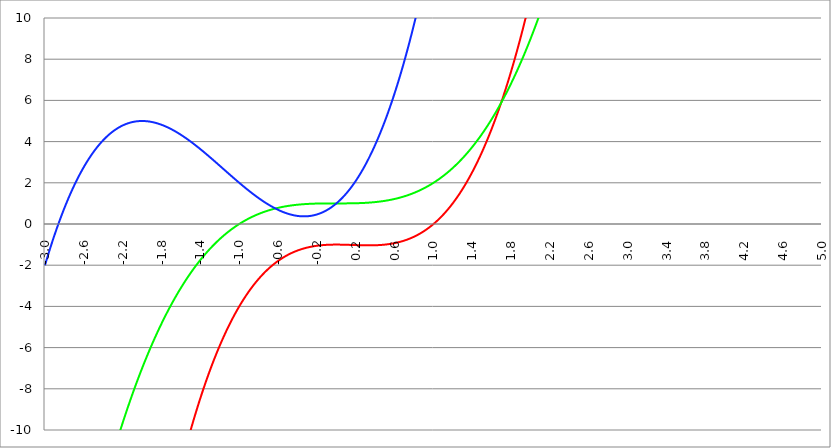
| Category | Series 1 | Series 0 | Series 2 |
|---|---|---|---|
| -3.0 | -64 | -26 | -2 |
| -2.996 | -63.76 | -25.892 | -1.936 |
| -2.992 | -63.521 | -25.785 | -1.873 |
| -2.988 | -63.283 | -25.677 | -1.81 |
| -2.984 | -63.045 | -25.57 | -1.747 |
| -2.98 | -62.808 | -25.464 | -1.684 |
| -2.976 | -62.571 | -25.357 | -1.622 |
| -2.972 | -62.335 | -25.251 | -1.561 |
| -2.968 | -62.099 | -25.145 | -1.499 |
| -2.964 | -61.865 | -25.04 | -1.438 |
| -2.96 | -61.63 | -24.934 | -1.377 |
| -2.956 | -61.397 | -24.829 | -1.317 |
| -2.952 | -61.164 | -24.725 | -1.257 |
| -2.948 | -60.931 | -24.62 | -1.197 |
| -2.944 | -60.699 | -24.516 | -1.138 |
| -2.94 | -60.468 | -24.412 | -1.079 |
| -2.936 | -60.237 | -24.309 | -1.021 |
| -2.932 | -60.007 | -24.205 | -0.962 |
| -2.928 | -59.778 | -24.102 | -0.904 |
| -2.924 | -59.549 | -24 | -0.847 |
| -2.92 | -59.321 | -23.897 | -0.789 |
| -2.916 | -59.093 | -23.795 | -0.732 |
| -2.912 | -58.866 | -23.693 | -0.676 |
| -2.908 | -58.639 | -23.591 | -0.62 |
| -2.904 | -58.413 | -23.49 | -0.564 |
| -2.9 | -58.188 | -23.389 | -0.508 |
| -2.896 | -57.963 | -23.288 | -0.453 |
| -2.892 | -57.739 | -23.188 | -0.398 |
| -2.888 | -57.516 | -23.087 | -0.343 |
| -2.884 | -57.293 | -22.988 | -0.289 |
| -2.88 | -57.07 | -22.888 | -0.235 |
| -2.876 | -56.848 | -22.788 | -0.181 |
| -2.872 | -56.627 | -22.689 | -0.128 |
| -2.868 | -56.406 | -22.591 | -0.075 |
| -2.864 | -56.186 | -22.492 | -0.022 |
| -2.86 | -55.967 | -22.394 | 0.03 |
| -2.856 | -55.748 | -22.296 | 0.082 |
| -2.852 | -55.53 | -22.198 | 0.134 |
| -2.848 | -55.312 | -22.1 | 0.185 |
| -2.844 | -55.095 | -22.003 | 0.236 |
| -2.84 | -54.878 | -21.906 | 0.287 |
| -2.836 | -54.662 | -21.81 | 0.337 |
| -2.832 | -54.447 | -21.713 | 0.387 |
| -2.828 | -54.232 | -21.617 | 0.437 |
| -2.824 | -54.018 | -21.521 | 0.486 |
| -2.82 | -53.804 | -21.426 | 0.535 |
| -2.816 | -53.591 | -21.33 | 0.584 |
| -2.812 | -53.378 | -21.235 | 0.633 |
| -2.808 | -53.166 | -21.141 | 0.681 |
| -2.804 | -52.955 | -21.046 | 0.728 |
| -2.8 | -52.744 | -20.952 | 0.776 |
| -2.796 | -52.534 | -20.858 | 0.823 |
| -2.792 | -52.324 | -20.764 | 0.87 |
| -2.788 | -52.115 | -20.671 | 0.917 |
| -2.784 | -51.906 | -20.578 | 0.963 |
| -2.78 | -51.698 | -20.485 | 1.009 |
| -2.776 | -51.491 | -20.392 | 1.055 |
| -2.772 | -51.284 | -20.3 | 1.1 |
| -2.768 | -51.078 | -20.208 | 1.145 |
| -2.764 | -50.872 | -20.116 | 1.19 |
| -2.76 | -50.667 | -20.025 | 1.234 |
| -2.756 | -50.462 | -19.933 | 1.278 |
| -2.752 | -50.258 | -19.842 | 1.322 |
| -2.748 | -50.055 | -19.752 | 1.365 |
| -2.744 | -49.852 | -19.661 | 1.409 |
| -2.74 | -49.649 | -19.571 | 1.452 |
| -2.736 | -49.447 | -19.481 | 1.494 |
| -2.732 | -49.246 | -19.391 | 1.536 |
| -2.728 | -49.045 | -19.302 | 1.578 |
| -2.724 | -48.845 | -19.213 | 1.62 |
| -2.72 | -48.646 | -19.124 | 1.662 |
| -2.716 | -48.447 | -19.035 | 1.703 |
| -2.712 | -48.248 | -18.947 | 1.743 |
| -2.708 | -48.05 | -18.858 | 1.784 |
| -2.704 | -47.853 | -18.771 | 1.824 |
| -2.7 | -47.656 | -18.683 | 1.864 |
| -2.696 | -47.46 | -18.596 | 1.904 |
| -2.692 | -47.264 | -18.509 | 1.943 |
| -2.688 | -47.069 | -18.422 | 1.982 |
| -2.684 | -46.874 | -18.335 | 2.021 |
| -2.68 | -46.68 | -18.249 | 2.059 |
| -2.676 | -46.487 | -18.163 | 2.097 |
| -2.672 | -46.294 | -18.077 | 2.135 |
| -2.668 | -46.101 | -17.991 | 2.173 |
| -2.664 | -45.909 | -17.906 | 2.21 |
| -2.66 | -45.718 | -17.821 | 2.247 |
| -2.656 | -45.527 | -17.736 | 2.284 |
| -2.652 | -45.337 | -17.652 | 2.32 |
| -2.648 | -45.147 | -17.568 | 2.356 |
| -2.644 | -44.958 | -17.484 | 2.392 |
| -2.64 | -44.769 | -17.4 | 2.428 |
| -2.636 | -44.581 | -17.316 | 2.463 |
| -2.632 | -44.393 | -17.233 | 2.498 |
| -2.628 | -44.206 | -17.15 | 2.533 |
| -2.624 | -44.02 | -17.067 | 2.567 |
| -2.62 | -43.834 | -16.985 | 2.601 |
| -2.616 | -43.648 | -16.902 | 2.635 |
| -2.612 | -43.464 | -16.82 | 2.669 |
| -2.608 | -43.279 | -16.739 | 2.702 |
| -2.604 | -43.095 | -16.657 | 2.735 |
| -2.6 | -42.912 | -16.576 | 2.768 |
| -2.596 | -42.729 | -16.495 | 2.801 |
| -2.592 | -42.547 | -16.414 | 2.833 |
| -2.588 | -42.365 | -16.334 | 2.865 |
| -2.584 | -42.184 | -16.254 | 2.896 |
| -2.58 | -42.003 | -16.174 | 2.928 |
| -2.576 | -41.823 | -16.094 | 2.959 |
| -2.572 | -41.644 | -16.014 | 2.99 |
| -2.568 | -41.465 | -15.935 | 3.02 |
| -2.564 | -41.286 | -15.856 | 3.051 |
| -2.56 | -41.108 | -15.777 | 3.081 |
| -2.556 | -40.931 | -15.699 | 3.111 |
| -2.552 | -40.754 | -15.62 | 3.14 |
| -2.548 | -40.577 | -15.542 | 3.169 |
| -2.544 | -40.401 | -15.465 | 3.198 |
| -2.54 | -40.226 | -15.387 | 3.227 |
| -2.536 | -40.051 | -15.31 | 3.256 |
| -2.532 | -39.876 | -15.233 | 3.284 |
| -2.528 | -39.703 | -15.156 | 3.312 |
| -2.524 | -39.529 | -15.079 | 3.339 |
| -2.52 | -39.356 | -15.003 | 3.367 |
| -2.516 | -39.184 | -14.927 | 3.394 |
| -2.512 | -39.012 | -14.851 | 3.421 |
| -2.508 | -38.841 | -14.775 | 3.447 |
| -2.504 | -38.67 | -14.7 | 3.474 |
| -2.5 | -38.5 | -14.625 | 3.5 |
| -2.496 | -38.33 | -14.55 | 3.526 |
| -2.492 | -38.161 | -14.475 | 3.551 |
| -2.488 | -37.992 | -14.401 | 3.577 |
| -2.484 | -37.824 | -14.327 | 3.602 |
| -2.48 | -37.656 | -14.253 | 3.627 |
| -2.476 | -37.489 | -14.179 | 3.651 |
| -2.472 | -37.323 | -14.106 | 3.676 |
| -2.467999999999999 | -37.156 | -14.033 | 3.7 |
| -2.463999999999999 | -36.991 | -13.96 | 3.724 |
| -2.459999999999999 | -36.825 | -13.887 | 3.747 |
| -2.455999999999999 | -36.661 | -13.814 | 3.771 |
| -2.451999999999999 | -36.497 | -13.742 | 3.794 |
| -2.447999999999999 | -36.333 | -13.67 | 3.817 |
| -2.443999999999999 | -36.17 | -13.598 | 3.839 |
| -2.439999999999999 | -36.007 | -13.527 | 3.862 |
| -2.435999999999999 | -35.845 | -13.455 | 3.884 |
| -2.431999999999999 | -35.683 | -13.384 | 3.906 |
| -2.427999999999999 | -35.522 | -13.314 | 3.927 |
| -2.423999999999999 | -35.362 | -13.243 | 3.949 |
| -2.419999999999999 | -35.201 | -13.172 | 3.97 |
| -2.415999999999999 | -35.042 | -13.102 | 3.991 |
| -2.411999999999999 | -34.883 | -13.032 | 4.011 |
| -2.407999999999999 | -34.724 | -12.963 | 4.032 |
| -2.403999999999999 | -34.566 | -12.893 | 4.052 |
| -2.399999999999999 | -34.408 | -12.824 | 4.072 |
| -2.395999999999999 | -34.251 | -12.755 | 4.092 |
| -2.391999999999999 | -34.094 | -12.686 | 4.111 |
| -2.387999999999999 | -33.938 | -12.618 | 4.13 |
| -2.383999999999999 | -33.782 | -12.549 | 4.149 |
| -2.379999999999999 | -33.627 | -12.481 | 4.168 |
| -2.375999999999999 | -33.472 | -12.413 | 4.187 |
| -2.371999999999999 | -33.318 | -12.346 | 4.205 |
| -2.367999999999999 | -33.164 | -12.278 | 4.223 |
| -2.363999999999999 | -33.011 | -12.211 | 4.241 |
| -2.359999999999999 | -32.858 | -12.144 | 4.259 |
| -2.355999999999999 | -32.706 | -12.078 | 4.276 |
| -2.351999999999999 | -32.554 | -12.011 | 4.293 |
| -2.347999999999999 | -32.403 | -11.945 | 4.31 |
| -2.343999999999999 | -32.252 | -11.879 | 4.327 |
| -2.339999999999999 | -32.101 | -11.813 | 4.343 |
| -2.335999999999999 | -31.952 | -11.747 | 4.36 |
| -2.331999999999999 | -31.802 | -11.682 | 4.376 |
| -2.327999999999999 | -31.653 | -11.617 | 4.392 |
| -2.323999999999999 | -31.505 | -11.552 | 4.407 |
| -2.319999999999999 | -31.357 | -11.487 | 4.422 |
| -2.315999999999999 | -31.209 | -11.423 | 4.438 |
| -2.311999999999999 | -31.062 | -11.358 | 4.453 |
| -2.307999999999999 | -30.916 | -11.294 | 4.467 |
| -2.303999999999999 | -30.77 | -11.231 | 4.482 |
| -2.299999999999999 | -30.624 | -11.167 | 4.496 |
| -2.295999999999999 | -30.479 | -11.104 | 4.51 |
| -2.291999999999999 | -30.334 | -11.04 | 4.524 |
| -2.288 | -30.19 | -10.978 | 4.538 |
| -2.284 | -30.046 | -10.915 | 4.551 |
| -2.279999999999999 | -29.903 | -10.852 | 4.564 |
| -2.275999999999999 | -29.76 | -10.79 | 4.577 |
| -2.271999999999999 | -29.618 | -10.728 | 4.59 |
| -2.268 | -29.476 | -10.666 | 4.602 |
| -2.264 | -29.335 | -10.605 | 4.615 |
| -2.259999999999999 | -29.194 | -10.543 | 4.627 |
| -2.255999999999999 | -29.054 | -10.482 | 4.639 |
| -2.251999999999999 | -28.914 | -10.421 | 4.65 |
| -2.248 | -28.774 | -10.36 | 4.662 |
| -2.244 | -28.635 | -10.3 | 4.673 |
| -2.239999999999999 | -28.496 | -10.239 | 4.684 |
| -2.235999999999999 | -28.358 | -10.179 | 4.695 |
| -2.231999999999999 | -28.221 | -10.119 | 4.706 |
| -2.228 | -28.083 | -10.06 | 4.716 |
| -2.224 | -27.947 | -10 | 4.727 |
| -2.219999999999999 | -27.81 | -9.941 | 4.737 |
| -2.215999999999999 | -27.675 | -9.882 | 4.747 |
| -2.211999999999999 | -27.539 | -9.823 | 4.756 |
| -2.208 | -27.404 | -9.765 | 4.766 |
| -2.204 | -27.27 | -9.706 | 4.775 |
| -2.199999999999999 | -27.136 | -9.648 | 4.784 |
| -2.195999999999999 | -27.002 | -9.59 | 4.793 |
| -2.191999999999999 | -26.869 | -9.532 | 4.802 |
| -2.188 | -26.737 | -9.475 | 4.81 |
| -2.184 | -26.605 | -9.417 | 4.818 |
| -2.179999999999999 | -26.473 | -9.36 | 4.826 |
| -2.175999999999999 | -26.342 | -9.303 | 4.834 |
| -2.171999999999999 | -26.211 | -9.247 | 4.842 |
| -2.168 | -26.08 | -9.19 | 4.849 |
| -2.164 | -25.95 | -9.134 | 4.857 |
| -2.159999999999999 | -25.821 | -9.078 | 4.864 |
| -2.155999999999999 | -25.692 | -9.022 | 4.871 |
| -2.151999999999999 | -25.563 | -8.966 | 4.877 |
| -2.148 | -25.435 | -8.911 | 4.884 |
| -2.144 | -25.308 | -8.855 | 4.89 |
| -2.139999999999999 | -25.18 | -8.8 | 4.897 |
| -2.135999999999999 | -25.053 | -8.745 | 4.902 |
| -2.131999999999999 | -24.927 | -8.691 | 4.908 |
| -2.128 | -24.801 | -8.636 | 4.914 |
| -2.124 | -24.676 | -8.582 | 4.919 |
| -2.119999999999999 | -24.551 | -8.528 | 4.925 |
| -2.115999999999999 | -24.426 | -8.474 | 4.93 |
| -2.111999999999999 | -24.302 | -8.421 | 4.934 |
| -2.108 | -24.178 | -8.367 | 4.939 |
| -2.104 | -24.055 | -8.314 | 4.944 |
| -2.099999999999999 | -23.932 | -8.261 | 4.948 |
| -2.095999999999999 | -23.81 | -8.208 | 4.952 |
| -2.091999999999999 | -23.688 | -8.156 | 4.956 |
| -2.088 | -23.566 | -8.103 | 4.96 |
| -2.084 | -23.445 | -8.051 | 4.964 |
| -2.079999999999999 | -23.324 | -7.999 | 4.967 |
| -2.075999999999999 | -23.204 | -7.947 | 4.97 |
| -2.071999999999999 | -23.084 | -7.895 | 4.973 |
| -2.068 | -22.965 | -7.844 | 4.976 |
| -2.064 | -22.846 | -7.793 | 4.979 |
| -2.059999999999999 | -22.727 | -7.742 | 4.982 |
| -2.055999999999999 | -22.609 | -7.691 | 4.984 |
| -2.051999999999999 | -22.491 | -7.64 | 4.986 |
| -2.048 | -22.374 | -7.59 | 4.988 |
| -2.044 | -22.257 | -7.54 | 4.99 |
| -2.039999999999999 | -22.141 | -7.49 | 4.992 |
| -2.035999999999999 | -22.025 | -7.44 | 4.993 |
| -2.031999999999999 | -21.909 | -7.39 | 4.995 |
| -2.028 | -21.794 | -7.341 | 4.996 |
| -2.024 | -21.68 | -7.291 | 4.997 |
| -2.019999999999999 | -21.565 | -7.242 | 4.998 |
| -2.015999999999999 | -21.451 | -7.194 | 4.999 |
| -2.011999999999999 | -21.338 | -7.145 | 4.999 |
| -2.008 | -21.225 | -7.096 | 5 |
| -2.004 | -21.112 | -7.048 | 5 |
| -1.999999999999999 | -21 | -7 | 5 |
| -1.995999999999999 | -20.888 | -6.952 | 5 |
| -1.991999999999999 | -20.777 | -6.904 | 5 |
| -1.987999999999999 | -20.666 | -6.857 | 4.999 |
| -1.983999999999999 | -20.555 | -6.81 | 4.999 |
| -1.979999999999999 | -20.445 | -6.762 | 4.998 |
| -1.975999999999999 | -20.335 | -6.715 | 4.997 |
| -1.971999999999999 | -20.226 | -6.669 | 4.996 |
| -1.967999999999999 | -20.117 | -6.622 | 4.995 |
| -1.963999999999999 | -20.009 | -6.576 | 4.994 |
| -1.959999999999999 | -19.901 | -6.53 | 4.992 |
| -1.955999999999999 | -19.793 | -6.484 | 4.99 |
| -1.951999999999999 | -19.686 | -6.438 | 4.989 |
| -1.947999999999999 | -19.579 | -6.392 | 4.987 |
| -1.943999999999999 | -19.472 | -6.347 | 4.985 |
| -1.939999999999999 | -19.366 | -6.301 | 4.982 |
| -1.935999999999999 | -19.261 | -6.256 | 4.98 |
| -1.931999999999999 | -19.155 | -6.211 | 4.978 |
| -1.927999999999999 | -19.051 | -6.167 | 4.975 |
| -1.923999999999999 | -18.946 | -6.122 | 4.972 |
| -1.919999999999999 | -18.842 | -6.078 | 4.969 |
| -1.915999999999999 | -18.739 | -6.034 | 4.966 |
| -1.911999999999999 | -18.635 | -5.99 | 4.963 |
| -1.907999999999999 | -18.532 | -5.946 | 4.959 |
| -1.903999999999999 | -18.43 | -5.902 | 4.956 |
| -1.899999999999999 | -18.328 | -5.859 | 4.952 |
| -1.895999999999999 | -18.226 | -5.816 | 4.948 |
| -1.891999999999999 | -18.125 | -5.773 | 4.944 |
| -1.887999999999999 | -18.024 | -5.73 | 4.94 |
| -1.883999999999999 | -17.924 | -5.687 | 4.936 |
| -1.879999999999999 | -17.824 | -5.645 | 4.931 |
| -1.875999999999999 | -17.724 | -5.602 | 4.927 |
| -1.871999999999999 | -17.625 | -5.56 | 4.922 |
| -1.867999999999999 | -17.526 | -5.518 | 4.917 |
| -1.863999999999999 | -17.427 | -5.476 | 4.913 |
| -1.859999999999999 | -17.329 | -5.435 | 4.907 |
| -1.855999999999999 | -17.232 | -5.393 | 4.902 |
| -1.851999999999999 | -17.134 | -5.352 | 4.897 |
| -1.847999999999999 | -17.037 | -5.311 | 4.892 |
| -1.843999999999999 | -16.941 | -5.27 | 4.886 |
| -1.839999999999999 | -16.845 | -5.23 | 4.88 |
| -1.835999999999999 | -16.749 | -5.189 | 4.874 |
| -1.831999999999999 | -16.653 | -5.149 | 4.868 |
| -1.827999999999999 | -16.558 | -5.108 | 4.862 |
| -1.823999999999999 | -16.464 | -5.068 | 4.856 |
| -1.819999999999999 | -16.37 | -5.029 | 4.85 |
| -1.815999999999999 | -16.276 | -4.989 | 4.843 |
| -1.811999999999999 | -16.182 | -4.949 | 4.837 |
| -1.807999999999999 | -16.089 | -4.91 | 4.83 |
| -1.803999999999999 | -15.996 | -4.871 | 4.823 |
| -1.799999999999999 | -15.904 | -4.832 | 4.816 |
| -1.795999999999999 | -15.812 | -4.793 | 4.809 |
| -1.791999999999999 | -15.72 | -4.755 | 4.802 |
| -1.787999999999999 | -15.629 | -4.716 | 4.794 |
| -1.783999999999999 | -15.538 | -4.678 | 4.787 |
| -1.779999999999999 | -15.448 | -4.64 | 4.779 |
| -1.775999999999999 | -15.358 | -4.602 | 4.772 |
| -1.771999999999999 | -15.268 | -4.564 | 4.764 |
| -1.767999999999999 | -15.179 | -4.526 | 4.756 |
| -1.763999999999999 | -15.09 | -4.489 | 4.748 |
| -1.759999999999999 | -15.001 | -4.452 | 4.74 |
| -1.755999999999999 | -14.913 | -4.415 | 4.731 |
| -1.751999999999999 | -14.825 | -4.378 | 4.723 |
| -1.747999999999999 | -14.738 | -4.341 | 4.714 |
| -1.743999999999999 | -14.65 | -4.304 | 4.706 |
| -1.739999999999999 | -14.564 | -4.268 | 4.697 |
| -1.735999999999999 | -14.477 | -4.232 | 4.688 |
| -1.731999999999999 | -14.391 | -4.196 | 4.679 |
| -1.727999999999999 | -14.306 | -4.16 | 4.67 |
| -1.723999999999999 | -14.22 | -4.124 | 4.661 |
| -1.719999999999999 | -14.135 | -4.088 | 4.652 |
| -1.715999999999999 | -14.051 | -4.053 | 4.643 |
| -1.711999999999999 | -13.966 | -4.018 | 4.633 |
| -1.707999999999999 | -13.883 | -3.983 | 4.623 |
| -1.703999999999999 | -13.799 | -3.948 | 4.614 |
| -1.699999999999999 | -13.716 | -3.913 | 4.604 |
| -1.695999999999999 | -13.633 | -3.878 | 4.594 |
| -1.691999999999999 | -13.551 | -3.844 | 4.584 |
| -1.687999999999999 | -13.469 | -3.81 | 4.574 |
| -1.683999999999999 | -13.387 | -3.776 | 4.564 |
| -1.679999999999999 | -13.306 | -3.742 | 4.554 |
| -1.675999999999999 | -13.225 | -3.708 | 4.543 |
| -1.671999999999999 | -13.144 | -3.674 | 4.533 |
| -1.667999999999999 | -13.064 | -3.641 | 4.522 |
| -1.663999999999999 | -12.984 | -3.607 | 4.511 |
| -1.659999999999999 | -12.904 | -3.574 | 4.501 |
| -1.655999999999999 | -12.825 | -3.541 | 4.49 |
| -1.651999999999999 | -12.746 | -3.508 | 4.479 |
| -1.647999999999999 | -12.668 | -3.476 | 4.468 |
| -1.643999999999999 | -12.589 | -3.443 | 4.457 |
| -1.639999999999999 | -12.511 | -3.411 | 4.445 |
| -1.635999999999999 | -12.434 | -3.379 | 4.434 |
| -1.631999999999999 | -12.357 | -3.347 | 4.423 |
| -1.627999999999999 | -12.28 | -3.315 | 4.411 |
| -1.623999999999999 | -12.204 | -3.283 | 4.399 |
| -1.619999999999999 | -12.127 | -3.252 | 4.388 |
| -1.615999999999999 | -12.052 | -3.22 | 4.376 |
| -1.611999999999999 | -11.976 | -3.189 | 4.364 |
| -1.607999999999999 | -11.901 | -3.158 | 4.352 |
| -1.603999999999999 | -11.826 | -3.127 | 4.34 |
| -1.599999999999999 | -11.752 | -3.096 | 4.328 |
| -1.595999999999999 | -11.678 | -3.065 | 4.316 |
| -1.591999999999999 | -11.604 | -3.035 | 4.304 |
| -1.587999999999999 | -11.531 | -3.005 | 4.291 |
| -1.583999999999999 | -11.458 | -2.974 | 4.279 |
| -1.579999999999999 | -11.385 | -2.944 | 4.266 |
| -1.575999999999999 | -11.313 | -2.914 | 4.254 |
| -1.571999999999999 | -11.241 | -2.885 | 4.241 |
| -1.567999999999999 | -11.169 | -2.855 | 4.228 |
| -1.563999999999999 | -11.097 | -2.826 | 4.215 |
| -1.559999999999999 | -11.026 | -2.796 | 4.202 |
| -1.555999999999999 | -10.956 | -2.767 | 4.189 |
| -1.551999999999999 | -10.885 | -2.738 | 4.176 |
| -1.547999999999999 | -10.815 | -2.709 | 4.163 |
| -1.543999999999999 | -10.746 | -2.681 | 4.15 |
| -1.539999999999999 | -10.676 | -2.652 | 4.137 |
| -1.535999999999999 | -10.607 | -2.624 | 4.123 |
| -1.531999999999999 | -10.538 | -2.596 | 4.11 |
| -1.527999999999999 | -10.47 | -2.568 | 4.096 |
| -1.523999999999999 | -10.402 | -2.54 | 4.083 |
| -1.519999999999999 | -10.334 | -2.512 | 4.069 |
| -1.515999999999999 | -10.267 | -2.484 | 4.055 |
| -1.511999999999999 | -10.199 | -2.457 | 4.042 |
| -1.507999999999999 | -10.133 | -2.429 | 4.028 |
| -1.503999999999999 | -10.066 | -2.402 | 4.014 |
| -1.499999999999999 | -10 | -2.375 | 4 |
| -1.495999999999999 | -9.934 | -2.348 | 3.986 |
| -1.491999999999999 | -9.869 | -2.321 | 3.972 |
| -1.487999999999999 | -9.803 | -2.295 | 3.958 |
| -1.483999999999999 | -9.739 | -2.268 | 3.943 |
| -1.479999999999999 | -9.674 | -2.242 | 3.929 |
| -1.475999999999999 | -9.61 | -2.216 | 3.915 |
| -1.471999999999999 | -9.546 | -2.19 | 3.9 |
| -1.467999999999999 | -9.482 | -2.164 | 3.886 |
| -1.463999999999999 | -9.419 | -2.138 | 3.872 |
| -1.459999999999999 | -9.356 | -2.112 | 3.857 |
| -1.455999999999999 | -9.293 | -2.087 | 3.842 |
| -1.451999999999999 | -9.231 | -2.061 | 3.828 |
| -1.447999999999999 | -9.169 | -2.036 | 3.813 |
| -1.443999999999999 | -9.107 | -2.011 | 3.798 |
| -1.439999999999999 | -9.046 | -1.986 | 3.783 |
| -1.435999999999999 | -8.984 | -1.961 | 3.768 |
| -1.431999999999999 | -8.924 | -1.936 | 3.753 |
| -1.427999999999999 | -8.863 | -1.912 | 3.738 |
| -1.423999999999999 | -8.803 | -1.888 | 3.723 |
| -1.419999999999999 | -8.743 | -1.863 | 3.708 |
| -1.415999999999999 | -8.683 | -1.839 | 3.693 |
| -1.411999999999999 | -8.624 | -1.815 | 3.678 |
| -1.407999999999999 | -8.565 | -1.791 | 3.663 |
| -1.403999999999999 | -8.506 | -1.768 | 3.647 |
| -1.399999999999999 | -8.448 | -1.744 | 3.632 |
| -1.395999999999999 | -8.39 | -1.721 | 3.617 |
| -1.391999999999999 | -8.332 | -1.697 | 3.601 |
| -1.387999999999999 | -8.275 | -1.674 | 3.586 |
| -1.383999999999999 | -8.217 | -1.651 | 3.57 |
| -1.379999999999999 | -8.161 | -1.628 | 3.555 |
| -1.375999999999999 | -8.104 | -1.605 | 3.539 |
| -1.371999999999999 | -8.048 | -1.583 | 3.523 |
| -1.367999999999998 | -7.992 | -1.56 | 3.508 |
| -1.363999999999998 | -7.936 | -1.538 | 3.492 |
| -1.359999999999998 | -7.881 | -1.515 | 3.476 |
| -1.355999999999998 | -7.825 | -1.493 | 3.46 |
| -1.351999999999998 | -7.771 | -1.471 | 3.445 |
| -1.347999999999998 | -7.716 | -1.449 | 3.429 |
| -1.343999999999998 | -7.662 | -1.428 | 3.413 |
| -1.339999999999998 | -7.608 | -1.406 | 3.397 |
| -1.335999999999998 | -7.554 | -1.385 | 3.381 |
| -1.331999999999998 | -7.501 | -1.363 | 3.365 |
| -1.327999999999998 | -7.448 | -1.342 | 3.349 |
| -1.323999999999998 | -7.395 | -1.321 | 3.333 |
| -1.319999999999998 | -7.342 | -1.3 | 3.317 |
| -1.315999999999998 | -7.29 | -1.279 | 3.301 |
| -1.311999999999998 | -7.238 | -1.258 | 3.285 |
| -1.307999999999998 | -7.186 | -1.238 | 3.268 |
| -1.303999999999998 | -7.135 | -1.217 | 3.252 |
| -1.299999999999998 | -7.084 | -1.197 | 3.236 |
| -1.295999999999998 | -7.033 | -1.177 | 3.22 |
| -1.291999999999998 | -6.983 | -1.157 | 3.203 |
| -1.287999999999998 | -6.932 | -1.137 | 3.187 |
| -1.283999999999998 | -6.882 | -1.117 | 3.171 |
| -1.279999999999998 | -6.833 | -1.097 | 3.154 |
| -1.275999999999998 | -6.783 | -1.078 | 3.138 |
| -1.271999999999998 | -6.734 | -1.058 | 3.122 |
| -1.267999999999998 | -6.685 | -1.039 | 3.105 |
| -1.263999999999998 | -6.637 | -1.019 | 3.089 |
| -1.259999999999998 | -6.588 | -1 | 3.072 |
| -1.255999999999998 | -6.54 | -0.981 | 3.056 |
| -1.251999999999998 | -6.493 | -0.963 | 3.039 |
| -1.247999999999998 | -6.445 | -0.944 | 3.023 |
| -1.243999999999998 | -6.398 | -0.925 | 3.006 |
| -1.239999999999998 | -6.351 | -0.907 | 2.99 |
| -1.235999999999998 | -6.304 | -0.888 | 2.973 |
| -1.231999999999998 | -6.258 | -0.87 | 2.957 |
| -1.227999999999998 | -6.212 | -0.852 | 2.94 |
| -1.223999999999998 | -6.166 | -0.834 | 2.924 |
| -1.219999999999998 | -6.12 | -0.816 | 2.907 |
| -1.215999999999998 | -6.075 | -0.798 | 2.891 |
| -1.211999999999998 | -6.03 | -0.78 | 2.874 |
| -1.207999999999998 | -5.985 | -0.763 | 2.857 |
| -1.203999999999998 | -5.94 | -0.745 | 2.841 |
| -1.199999999999998 | -5.896 | -0.728 | 2.824 |
| -1.195999999999998 | -5.852 | -0.711 | 2.807 |
| -1.191999999999998 | -5.808 | -0.694 | 2.791 |
| -1.187999999999998 | -5.765 | -0.677 | 2.774 |
| -1.183999999999998 | -5.721 | -0.66 | 2.757 |
| -1.179999999999998 | -5.678 | -0.643 | 2.741 |
| -1.175999999999998 | -5.636 | -0.626 | 2.724 |
| -1.171999999999998 | -5.593 | -0.61 | 2.707 |
| -1.167999999999998 | -5.551 | -0.593 | 2.691 |
| -1.163999999999998 | -5.509 | -0.577 | 2.674 |
| -1.159999999999998 | -5.467 | -0.561 | 2.657 |
| -1.155999999999998 | -5.426 | -0.545 | 2.641 |
| -1.151999999999998 | -5.385 | -0.529 | 2.624 |
| -1.147999999999998 | -5.344 | -0.513 | 2.607 |
| -1.143999999999998 | -5.303 | -0.497 | 2.591 |
| -1.139999999999998 | -5.263 | -0.482 | 2.574 |
| -1.135999999999998 | -5.223 | -0.466 | 2.557 |
| -1.131999999999998 | -5.183 | -0.451 | 2.541 |
| -1.127999999999998 | -5.143 | -0.435 | 2.524 |
| -1.123999999999998 | -5.103 | -0.42 | 2.508 |
| -1.119999999999998 | -5.064 | -0.405 | 2.491 |
| -1.115999999999998 | -5.025 | -0.39 | 2.474 |
| -1.111999999999998 | -4.987 | -0.375 | 2.458 |
| -1.107999999999998 | -4.948 | -0.36 | 2.441 |
| -1.103999999999998 | -4.91 | -0.346 | 2.425 |
| -1.099999999999998 | -4.872 | -0.331 | 2.408 |
| -1.095999999999998 | -4.834 | -0.317 | 2.391 |
| -1.091999999999998 | -4.797 | -0.302 | 2.375 |
| -1.087999999999998 | -4.76 | -0.288 | 2.358 |
| -1.083999999999998 | -4.723 | -0.274 | 2.342 |
| -1.079999999999998 | -4.686 | -0.26 | 2.325 |
| -1.075999999999998 | -4.649 | -0.246 | 2.309 |
| -1.071999999999998 | -4.613 | -0.232 | 2.292 |
| -1.067999999999998 | -4.577 | -0.218 | 2.276 |
| -1.063999999999998 | -4.541 | -0.205 | 2.26 |
| -1.059999999999998 | -4.506 | -0.191 | 2.243 |
| -1.055999999999998 | -4.47 | -0.178 | 2.227 |
| -1.051999999999998 | -4.435 | -0.164 | 2.21 |
| -1.047999999999998 | -4.4 | -0.151 | 2.194 |
| -1.043999999999998 | -4.366 | -0.138 | 2.178 |
| -1.039999999999998 | -4.331 | -0.125 | 2.161 |
| -1.035999999999998 | -4.297 | -0.112 | 2.145 |
| -1.031999999999998 | -4.263 | -0.099 | 2.129 |
| -1.027999999999998 | -4.23 | -0.086 | 2.113 |
| -1.023999999999998 | -4.196 | -0.074 | 2.097 |
| -1.019999999999998 | -4.163 | -0.061 | 2.08 |
| -1.015999999999998 | -4.13 | -0.049 | 2.064 |
| -1.011999999999998 | -4.097 | -0.036 | 2.048 |
| -1.007999999999998 | -4.064 | -0.024 | 2.032 |
| -1.003999999999998 | -4.032 | -0.012 | 2.016 |
| -0.999999999999998 | -4 | 0 | 2 |
| -0.995999999999998 | -3.968 | 0.012 | 1.984 |
| -0.991999999999998 | -3.936 | 0.024 | 1.968 |
| -0.987999999999998 | -3.905 | 0.036 | 1.952 |
| -0.983999999999998 | -3.874 | 0.047 | 1.936 |
| -0.979999999999998 | -3.843 | 0.059 | 1.92 |
| -0.975999999999998 | -3.812 | 0.07 | 1.905 |
| -0.971999999999998 | -3.781 | 0.082 | 1.889 |
| -0.967999999999998 | -3.751 | 0.093 | 1.873 |
| -0.963999999999998 | -3.721 | 0.104 | 1.857 |
| -0.959999999999998 | -3.691 | 0.115 | 1.842 |
| -0.955999999999998 | -3.661 | 0.126 | 1.826 |
| -0.951999999999998 | -3.632 | 0.137 | 1.811 |
| -0.947999999999998 | -3.603 | 0.148 | 1.795 |
| -0.943999999999998 | -3.574 | 0.159 | 1.779 |
| -0.939999999999998 | -3.545 | 0.169 | 1.764 |
| -0.935999999999998 | -3.516 | 0.18 | 1.749 |
| -0.931999999999998 | -3.488 | 0.19 | 1.733 |
| -0.927999999999998 | -3.46 | 0.201 | 1.718 |
| -0.923999999999998 | -3.432 | 0.211 | 1.703 |
| -0.919999999999998 | -3.404 | 0.221 | 1.687 |
| -0.915999999999998 | -3.376 | 0.231 | 1.672 |
| -0.911999999999998 | -3.349 | 0.241 | 1.657 |
| -0.907999999999998 | -3.322 | 0.251 | 1.642 |
| -0.903999999999998 | -3.295 | 0.261 | 1.627 |
| -0.899999999999998 | -3.268 | 0.271 | 1.612 |
| -0.895999999999998 | -3.241 | 0.281 | 1.597 |
| -0.891999999999998 | -3.215 | 0.29 | 1.582 |
| -0.887999999999998 | -3.189 | 0.3 | 1.567 |
| -0.883999999999998 | -3.163 | 0.309 | 1.553 |
| -0.879999999999998 | -3.137 | 0.319 | 1.538 |
| -0.875999999999998 | -3.112 | 0.328 | 1.523 |
| -0.871999999999998 | -3.086 | 0.337 | 1.509 |
| -0.867999999999998 | -3.061 | 0.346 | 1.494 |
| -0.863999999999998 | -3.036 | 0.355 | 1.48 |
| -0.859999999999998 | -3.012 | 0.364 | 1.465 |
| -0.855999999999998 | -2.987 | 0.373 | 1.451 |
| -0.851999999999998 | -2.963 | 0.382 | 1.436 |
| -0.847999999999998 | -2.939 | 0.39 | 1.422 |
| -0.843999999999998 | -2.915 | 0.399 | 1.408 |
| -0.839999999999998 | -2.891 | 0.407 | 1.394 |
| -0.835999999999998 | -2.867 | 0.416 | 1.38 |
| -0.831999999999998 | -2.844 | 0.424 | 1.366 |
| -0.827999999999998 | -2.821 | 0.432 | 1.352 |
| -0.823999999999998 | -2.798 | 0.441 | 1.338 |
| -0.819999999999998 | -2.775 | 0.449 | 1.324 |
| -0.815999999999998 | -2.753 | 0.457 | 1.31 |
| -0.811999999999998 | -2.73 | 0.465 | 1.297 |
| -0.807999999999998 | -2.708 | 0.472 | 1.283 |
| -0.803999999999998 | -2.686 | 0.48 | 1.269 |
| -0.799999999999998 | -2.664 | 0.488 | 1.256 |
| -0.795999999999998 | -2.642 | 0.496 | 1.243 |
| -0.791999999999998 | -2.621 | 0.503 | 1.229 |
| -0.787999999999998 | -2.6 | 0.511 | 1.216 |
| -0.783999999999998 | -2.578 | 0.518 | 1.203 |
| -0.779999999999998 | -2.558 | 0.525 | 1.19 |
| -0.775999999999998 | -2.537 | 0.533 | 1.177 |
| -0.771999999999998 | -2.516 | 0.54 | 1.164 |
| -0.767999999999998 | -2.496 | 0.547 | 1.151 |
| -0.763999999999998 | -2.476 | 0.554 | 1.138 |
| -0.759999999999998 | -2.456 | 0.561 | 1.125 |
| -0.755999999999998 | -2.436 | 0.568 | 1.113 |
| -0.751999999999998 | -2.416 | 0.575 | 1.1 |
| -0.747999999999998 | -2.397 | 0.581 | 1.088 |
| -0.743999999999998 | -2.377 | 0.588 | 1.075 |
| -0.739999999999998 | -2.358 | 0.595 | 1.063 |
| -0.735999999999998 | -2.339 | 0.601 | 1.05 |
| -0.731999999999998 | -2.32 | 0.608 | 1.038 |
| -0.727999999999998 | -2.302 | 0.614 | 1.026 |
| -0.723999999999998 | -2.283 | 0.62 | 1.014 |
| -0.719999999999998 | -2.265 | 0.627 | 1.002 |
| -0.715999999999998 | -2.247 | 0.633 | 0.99 |
| -0.711999999999998 | -2.229 | 0.639 | 0.979 |
| -0.707999999999998 | -2.211 | 0.645 | 0.967 |
| -0.703999999999998 | -2.193 | 0.651 | 0.955 |
| -0.699999999999998 | -2.176 | 0.657 | 0.944 |
| -0.695999999999998 | -2.159 | 0.663 | 0.933 |
| -0.691999999999998 | -2.142 | 0.669 | 0.921 |
| -0.687999999999998 | -2.125 | 0.674 | 0.91 |
| -0.683999999999998 | -2.108 | 0.68 | 0.899 |
| -0.679999999999998 | -2.091 | 0.686 | 0.888 |
| -0.675999999999998 | -2.075 | 0.691 | 0.877 |
| -0.671999999999998 | -2.059 | 0.697 | 0.866 |
| -0.667999999999998 | -2.042 | 0.702 | 0.855 |
| -0.663999999999998 | -2.026 | 0.707 | 0.845 |
| -0.659999999999998 | -2.011 | 0.713 | 0.834 |
| -0.655999999999998 | -1.995 | 0.718 | 0.824 |
| -0.651999999999998 | -1.979 | 0.723 | 0.813 |
| -0.647999999999998 | -1.964 | 0.728 | 0.803 |
| -0.643999999999998 | -1.949 | 0.733 | 0.793 |
| -0.639999999999998 | -1.934 | 0.738 | 0.783 |
| -0.635999999999998 | -1.919 | 0.743 | 0.773 |
| -0.631999999999998 | -1.904 | 0.748 | 0.763 |
| -0.627999999999998 | -1.89 | 0.752 | 0.753 |
| -0.623999999999998 | -1.875 | 0.757 | 0.744 |
| -0.619999999999998 | -1.861 | 0.762 | 0.734 |
| -0.615999999999998 | -1.847 | 0.766 | 0.725 |
| -0.611999999999998 | -1.833 | 0.771 | 0.715 |
| -0.607999999999998 | -1.819 | 0.775 | 0.706 |
| -0.603999999999998 | -1.806 | 0.78 | 0.697 |
| -0.599999999999998 | -1.792 | 0.784 | 0.688 |
| -0.595999999999998 | -1.779 | 0.788 | 0.679 |
| -0.591999999999998 | -1.765 | 0.793 | 0.67 |
| -0.587999999999998 | -1.752 | 0.797 | 0.662 |
| -0.583999999999998 | -1.739 | 0.801 | 0.653 |
| -0.579999999999998 | -1.727 | 0.805 | 0.645 |
| -0.575999999999998 | -1.714 | 0.809 | 0.636 |
| -0.571999999999998 | -1.701 | 0.813 | 0.628 |
| -0.567999999999998 | -1.689 | 0.817 | 0.62 |
| -0.563999999999998 | -1.677 | 0.821 | 0.612 |
| -0.559999999999998 | -1.665 | 0.824 | 0.604 |
| -0.555999999999998 | -1.653 | 0.828 | 0.596 |
| -0.551999999999998 | -1.641 | 0.832 | 0.589 |
| -0.547999999999998 | -1.629 | 0.835 | 0.581 |
| -0.543999999999998 | -1.618 | 0.839 | 0.574 |
| -0.539999999999998 | -1.607 | 0.843 | 0.566 |
| -0.535999999999998 | -1.595 | 0.846 | 0.559 |
| -0.531999999999998 | -1.584 | 0.849 | 0.552 |
| -0.527999999999998 | -1.573 | 0.853 | 0.545 |
| -0.523999999999998 | -1.562 | 0.856 | 0.538 |
| -0.519999999999998 | -1.552 | 0.859 | 0.532 |
| -0.515999999999998 | -1.541 | 0.863 | 0.525 |
| -0.511999999999998 | -1.531 | 0.866 | 0.519 |
| -0.507999999999998 | -1.52 | 0.869 | 0.512 |
| -0.503999999999998 | -1.51 | 0.872 | 0.506 |
| -0.499999999999998 | -1.5 | 0.875 | 0.5 |
| -0.495999999999998 | -1.49 | 0.878 | 0.494 |
| -0.491999999999998 | -1.48 | 0.881 | 0.488 |
| -0.487999999999998 | -1.471 | 0.884 | 0.483 |
| -0.483999999999998 | -1.461 | 0.887 | 0.477 |
| -0.479999999999998 | -1.452 | 0.889 | 0.472 |
| -0.475999999999998 | -1.442 | 0.892 | 0.466 |
| -0.471999999999998 | -1.433 | 0.895 | 0.461 |
| -0.467999999999998 | -1.424 | 0.897 | 0.456 |
| -0.463999999999998 | -1.415 | 0.9 | 0.451 |
| -0.459999999999998 | -1.406 | 0.903 | 0.447 |
| -0.455999999999998 | -1.398 | 0.905 | 0.442 |
| -0.451999999999998 | -1.389 | 0.908 | 0.437 |
| -0.447999999999998 | -1.381 | 0.91 | 0.433 |
| -0.443999999999998 | -1.372 | 0.912 | 0.429 |
| -0.439999999999998 | -1.364 | 0.915 | 0.425 |
| -0.435999999999998 | -1.356 | 0.917 | 0.421 |
| -0.431999999999998 | -1.348 | 0.919 | 0.417 |
| -0.427999999999998 | -1.34 | 0.922 | 0.413 |
| -0.423999999999998 | -1.332 | 0.924 | 0.41 |
| -0.419999999999998 | -1.325 | 0.926 | 0.407 |
| -0.415999999999998 | -1.317 | 0.928 | 0.403 |
| -0.411999999999998 | -1.31 | 0.93 | 0.4 |
| -0.407999999999998 | -1.302 | 0.932 | 0.397 |
| -0.403999999999998 | -1.295 | 0.934 | 0.395 |
| -0.399999999999998 | -1.288 | 0.936 | 0.392 |
| -0.395999999999998 | -1.281 | 0.938 | 0.39 |
| -0.391999999999998 | -1.274 | 0.94 | 0.387 |
| -0.387999999999998 | -1.267 | 0.942 | 0.385 |
| -0.383999999999998 | -1.261 | 0.943 | 0.383 |
| -0.379999999999998 | -1.254 | 0.945 | 0.381 |
| -0.375999999999998 | -1.248 | 0.947 | 0.379 |
| -0.371999999999998 | -1.241 | 0.949 | 0.378 |
| -0.367999999999998 | -1.235 | 0.95 | 0.376 |
| -0.363999999999998 | -1.229 | 0.952 | 0.375 |
| -0.359999999999998 | -1.223 | 0.953 | 0.374 |
| -0.355999999999998 | -1.217 | 0.955 | 0.373 |
| -0.351999999999998 | -1.211 | 0.956 | 0.372 |
| -0.347999999999998 | -1.205 | 0.958 | 0.371 |
| -0.343999999999998 | -1.2 | 0.959 | 0.371 |
| -0.339999999999998 | -1.194 | 0.961 | 0.371 |
| -0.335999999999998 | -1.189 | 0.962 | 0.37 |
| -0.331999999999998 | -1.183 | 0.963 | 0.37 |
| -0.327999999999998 | -1.178 | 0.965 | 0.371 |
| -0.323999999999998 | -1.173 | 0.966 | 0.371 |
| -0.319999999999998 | -1.168 | 0.967 | 0.371 |
| -0.315999999999998 | -1.163 | 0.968 | 0.372 |
| -0.311999999999998 | -1.158 | 0.97 | 0.373 |
| -0.307999999999998 | -1.153 | 0.971 | 0.374 |
| -0.303999999999998 | -1.149 | 0.972 | 0.375 |
| -0.299999999999998 | -1.144 | 0.973 | 0.376 |
| -0.295999999999998 | -1.139 | 0.974 | 0.377 |
| -0.291999999999998 | -1.135 | 0.975 | 0.379 |
| -0.287999999999998 | -1.131 | 0.976 | 0.381 |
| -0.283999999999998 | -1.126 | 0.977 | 0.383 |
| -0.279999999999998 | -1.122 | 0.978 | 0.385 |
| -0.275999999999998 | -1.118 | 0.979 | 0.387 |
| -0.271999999999998 | -1.114 | 0.98 | 0.39 |
| -0.267999999999998 | -1.11 | 0.981 | 0.392 |
| -0.263999999999998 | -1.106 | 0.982 | 0.395 |
| -0.259999999999998 | -1.103 | 0.982 | 0.398 |
| -0.255999999999998 | -1.099 | 0.983 | 0.401 |
| -0.251999999999998 | -1.096 | 0.984 | 0.405 |
| -0.247999999999998 | -1.092 | 0.985 | 0.408 |
| -0.243999999999998 | -1.089 | 0.985 | 0.412 |
| -0.239999999999998 | -1.085 | 0.986 | 0.416 |
| -0.235999999999998 | -1.082 | 0.987 | 0.42 |
| -0.231999999999998 | -1.079 | 0.988 | 0.424 |
| -0.227999999999998 | -1.076 | 0.988 | 0.428 |
| -0.223999999999998 | -1.073 | 0.989 | 0.433 |
| -0.219999999999998 | -1.07 | 0.989 | 0.438 |
| -0.215999999999998 | -1.067 | 0.99 | 0.442 |
| -0.211999999999998 | -1.064 | 0.99 | 0.448 |
| -0.207999999999998 | -1.061 | 0.991 | 0.453 |
| -0.203999999999998 | -1.059 | 0.992 | 0.458 |
| -0.199999999999997 | -1.056 | 0.992 | 0.464 |
| -0.195999999999997 | -1.053 | 0.992 | 0.47 |
| -0.191999999999997 | -1.051 | 0.993 | 0.476 |
| -0.187999999999997 | -1.049 | 0.993 | 0.482 |
| -0.183999999999997 | -1.046 | 0.994 | 0.489 |
| -0.179999999999997 | -1.044 | 0.994 | 0.495 |
| -0.175999999999997 | -1.042 | 0.995 | 0.502 |
| -0.171999999999997 | -1.04 | 0.995 | 0.509 |
| -0.167999999999997 | -1.038 | 0.995 | 0.516 |
| -0.163999999999997 | -1.036 | 0.996 | 0.523 |
| -0.159999999999997 | -1.034 | 0.996 | 0.531 |
| -0.155999999999997 | -1.032 | 0.996 | 0.539 |
| -0.151999999999997 | -1.03 | 0.996 | 0.547 |
| -0.147999999999997 | -1.028 | 0.997 | 0.555 |
| -0.143999999999997 | -1.027 | 0.997 | 0.563 |
| -0.139999999999997 | -1.025 | 0.997 | 0.572 |
| -0.135999999999997 | -1.024 | 0.997 | 0.58 |
| -0.131999999999997 | -1.022 | 0.998 | 0.589 |
| -0.127999999999997 | -1.021 | 0.998 | 0.598 |
| -0.123999999999997 | -1.019 | 0.998 | 0.608 |
| -0.119999999999997 | -1.018 | 0.998 | 0.617 |
| -0.115999999999997 | -1.017 | 0.998 | 0.627 |
| -0.111999999999997 | -1.015 | 0.999 | 0.637 |
| -0.107999999999997 | -1.014 | 0.999 | 0.647 |
| -0.103999999999997 | -1.013 | 0.999 | 0.657 |
| -0.0999999999999974 | -1.012 | 0.999 | 0.668 |
| -0.0959999999999974 | -1.011 | 0.999 | 0.679 |
| -0.0919999999999974 | -1.01 | 0.999 | 0.69 |
| -0.0879999999999974 | -1.009 | 0.999 | 0.701 |
| -0.0839999999999974 | -1.008 | 0.999 | 0.712 |
| -0.0799999999999974 | -1.007 | 0.999 | 0.724 |
| -0.0759999999999974 | -1.007 | 1 | 0.736 |
| -0.0719999999999974 | -1.006 | 1 | 0.748 |
| -0.0679999999999974 | -1.005 | 1 | 0.76 |
| -0.0639999999999974 | -1.005 | 1 | 0.772 |
| -0.0599999999999974 | -1.004 | 1 | 0.785 |
| -0.0559999999999974 | -1.003 | 1 | 0.798 |
| -0.0519999999999974 | -1.003 | 1 | 0.811 |
| -0.0479999999999974 | -1.003 | 1 | 0.824 |
| -0.0439999999999974 | -1.002 | 1 | 0.837 |
| -0.0399999999999974 | -1.002 | 1 | 0.851 |
| -0.0359999999999974 | -1.001 | 1 | 0.865 |
| -0.0319999999999974 | -1.001 | 1 | 0.879 |
| -0.0279999999999974 | -1.001 | 1 | 0.893 |
| -0.0239999999999974 | -1.001 | 1 | 0.908 |
| -0.0199999999999974 | -1 | 1 | 0.923 |
| -0.0159999999999974 | -1 | 1 | 0.938 |
| -0.0119999999999974 | -1 | 1 | 0.953 |
| -0.00799999999999736 | -1 | 1 | 0.968 |
| -0.00399999999999736 | -1 | 1 | 0.984 |
| 2.63677968348475e-15 | -1 | 1 | 1 |
| 0.00400000000000264 | -1 | 1 | 1.016 |
| 0.00800000000000264 | -1 | 1 | 1.032 |
| 0.0120000000000026 | -1 | 1 | 1.049 |
| 0.0160000000000026 | -1 | 1 | 1.066 |
| 0.0200000000000026 | -1 | 1 | 1.083 |
| 0.0240000000000026 | -1.001 | 1 | 1.1 |
| 0.0280000000000026 | -1.001 | 1 | 1.118 |
| 0.0320000000000026 | -1.001 | 1 | 1.135 |
| 0.0360000000000026 | -1.001 | 1 | 1.153 |
| 0.0400000000000026 | -1.001 | 1 | 1.171 |
| 0.0440000000000026 | -1.002 | 1 | 1.19 |
| 0.0480000000000026 | -1.002 | 1 | 1.208 |
| 0.0520000000000026 | -1.002 | 1 | 1.227 |
| 0.0560000000000026 | -1.003 | 1 | 1.246 |
| 0.0600000000000027 | -1.003 | 1 | 1.266 |
| 0.0640000000000027 | -1.004 | 1 | 1.285 |
| 0.0680000000000027 | -1.004 | 1 | 1.305 |
| 0.0720000000000027 | -1.004 | 1 | 1.325 |
| 0.0760000000000027 | -1.005 | 1 | 1.345 |
| 0.0800000000000027 | -1.005 | 1.001 | 1.366 |
| 0.0840000000000027 | -1.006 | 1.001 | 1.387 |
| 0.0880000000000027 | -1.006 | 1.001 | 1.408 |
| 0.0920000000000027 | -1.007 | 1.001 | 1.429 |
| 0.0960000000000027 | -1.007 | 1.001 | 1.45 |
| 0.100000000000003 | -1.008 | 1.001 | 1.472 |
| 0.104000000000003 | -1.009 | 1.001 | 1.494 |
| 0.108000000000003 | -1.009 | 1.001 | 1.516 |
| 0.112000000000003 | -1.01 | 1.001 | 1.539 |
| 0.116000000000003 | -1.01 | 1.002 | 1.561 |
| 0.120000000000003 | -1.011 | 1.002 | 1.584 |
| 0.124000000000003 | -1.012 | 1.002 | 1.607 |
| 0.128000000000003 | -1.012 | 1.002 | 1.631 |
| 0.132000000000003 | -1.013 | 1.002 | 1.655 |
| 0.136000000000003 | -1.013 | 1.003 | 1.679 |
| 0.140000000000003 | -1.014 | 1.003 | 1.703 |
| 0.144000000000003 | -1.015 | 1.003 | 1.727 |
| 0.148000000000003 | -1.015 | 1.003 | 1.752 |
| 0.152000000000003 | -1.016 | 1.004 | 1.777 |
| 0.156000000000003 | -1.017 | 1.004 | 1.802 |
| 0.160000000000003 | -1.017 | 1.004 | 1.827 |
| 0.164000000000003 | -1.018 | 1.004 | 1.853 |
| 0.168000000000003 | -1.019 | 1.005 | 1.879 |
| 0.172000000000003 | -1.019 | 1.005 | 1.905 |
| 0.176000000000003 | -1.02 | 1.005 | 1.932 |
| 0.180000000000003 | -1.021 | 1.006 | 1.958 |
| 0.184000000000003 | -1.021 | 1.006 | 1.985 |
| 0.188000000000003 | -1.022 | 1.007 | 2.013 |
| 0.192000000000003 | -1.023 | 1.007 | 2.04 |
| 0.196000000000003 | -1.023 | 1.008 | 2.068 |
| 0.200000000000003 | -1.024 | 1.008 | 2.096 |
| 0.204000000000003 | -1.025 | 1.008 | 2.124 |
| 0.208000000000003 | -1.025 | 1.009 | 2.153 |
| 0.212000000000003 | -1.026 | 1.01 | 2.182 |
| 0.216000000000003 | -1.027 | 1.01 | 2.211 |
| 0.220000000000003 | -1.027 | 1.011 | 2.24 |
| 0.224000000000003 | -1.028 | 1.011 | 2.27 |
| 0.228000000000003 | -1.028 | 1.012 | 2.3 |
| 0.232000000000003 | -1.029 | 1.012 | 2.33 |
| 0.236000000000003 | -1.029 | 1.013 | 2.36 |
| 0.240000000000003 | -1.03 | 1.014 | 2.391 |
| 0.244000000000003 | -1.03 | 1.015 | 2.422 |
| 0.248000000000003 | -1.031 | 1.015 | 2.453 |
| 0.252000000000003 | -1.031 | 1.016 | 2.485 |
| 0.256000000000003 | -1.032 | 1.017 | 2.516 |
| 0.260000000000003 | -1.032 | 1.018 | 2.548 |
| 0.264000000000003 | -1.033 | 1.018 | 2.581 |
| 0.268000000000003 | -1.033 | 1.019 | 2.613 |
| 0.272000000000003 | -1.034 | 1.02 | 2.646 |
| 0.276000000000003 | -1.034 | 1.021 | 2.679 |
| 0.280000000000003 | -1.034 | 1.022 | 2.713 |
| 0.284000000000003 | -1.035 | 1.023 | 2.746 |
| 0.288000000000003 | -1.035 | 1.024 | 2.78 |
| 0.292000000000003 | -1.035 | 1.025 | 2.815 |
| 0.296000000000003 | -1.036 | 1.026 | 2.849 |
| 0.300000000000003 | -1.036 | 1.027 | 2.884 |
| 0.304000000000003 | -1.036 | 1.028 | 2.919 |
| 0.308000000000003 | -1.036 | 1.029 | 2.954 |
| 0.312000000000003 | -1.037 | 1.03 | 2.99 |
| 0.316000000000003 | -1.037 | 1.032 | 3.026 |
| 0.320000000000003 | -1.037 | 1.033 | 3.062 |
| 0.324000000000003 | -1.037 | 1.034 | 3.099 |
| 0.328000000000003 | -1.037 | 1.035 | 3.136 |
| 0.332000000000003 | -1.037 | 1.037 | 3.173 |
| 0.336000000000003 | -1.037 | 1.038 | 3.21 |
| 0.340000000000003 | -1.037 | 1.039 | 3.248 |
| 0.344000000000003 | -1.037 | 1.041 | 3.286 |
| 0.348000000000003 | -1.037 | 1.042 | 3.324 |
| 0.352000000000003 | -1.037 | 1.044 | 3.363 |
| 0.356000000000003 | -1.036 | 1.045 | 3.401 |
| 0.360000000000003 | -1.036 | 1.047 | 3.441 |
| 0.364000000000003 | -1.036 | 1.048 | 3.48 |
| 0.368000000000003 | -1.036 | 1.05 | 3.52 |
| 0.372000000000003 | -1.035 | 1.051 | 3.56 |
| 0.376000000000003 | -1.035 | 1.053 | 3.6 |
| 0.380000000000003 | -1.035 | 1.055 | 3.641 |
| 0.384000000000003 | -1.034 | 1.057 | 3.681 |
| 0.388000000000003 | -1.034 | 1.058 | 3.723 |
| 0.392000000000003 | -1.033 | 1.06 | 3.764 |
| 0.396000000000003 | -1.033 | 1.062 | 3.806 |
| 0.400000000000003 | -1.032 | 1.064 | 3.848 |
| 0.404000000000003 | -1.031 | 1.066 | 3.89 |
| 0.408000000000003 | -1.031 | 1.068 | 3.933 |
| 0.412000000000003 | -1.03 | 1.07 | 3.976 |
| 0.416000000000003 | -1.029 | 1.072 | 4.019 |
| 0.420000000000003 | -1.028 | 1.074 | 4.063 |
| 0.424000000000003 | -1.027 | 1.076 | 4.107 |
| 0.428000000000003 | -1.026 | 1.078 | 4.151 |
| 0.432000000000003 | -1.025 | 1.081 | 4.196 |
| 0.436000000000003 | -1.024 | 1.083 | 4.24 |
| 0.440000000000003 | -1.023 | 1.085 | 4.286 |
| 0.444000000000003 | -1.022 | 1.088 | 4.331 |
| 0.448000000000003 | -1.021 | 1.09 | 4.377 |
| 0.452000000000003 | -1.02 | 1.092 | 4.423 |
| 0.456000000000003 | -1.018 | 1.095 | 4.469 |
| 0.460000000000003 | -1.017 | 1.097 | 4.516 |
| 0.464000000000003 | -1.016 | 1.1 | 4.563 |
| 0.468000000000003 | -1.014 | 1.103 | 4.61 |
| 0.472000000000003 | -1.012 | 1.105 | 4.658 |
| 0.476000000000003 | -1.011 | 1.108 | 4.706 |
| 0.480000000000003 | -1.009 | 1.111 | 4.754 |
| 0.484000000000003 | -1.007 | 1.113 | 4.803 |
| 0.488000000000003 | -1.006 | 1.116 | 4.851 |
| 0.492000000000003 | -1.004 | 1.119 | 4.901 |
| 0.496000000000003 | -1.002 | 1.122 | 4.95 |
| 0.500000000000003 | -1 | 1.125 | 5 |
| 0.504000000000003 | -0.998 | 1.128 | 5.05 |
| 0.508000000000003 | -0.996 | 1.131 | 5.101 |
| 0.512000000000003 | -0.994 | 1.134 | 5.151 |
| 0.516000000000003 | -0.991 | 1.137 | 5.203 |
| 0.520000000000003 | -0.989 | 1.141 | 5.254 |
| 0.524000000000003 | -0.987 | 1.144 | 5.306 |
| 0.528000000000003 | -0.984 | 1.147 | 5.358 |
| 0.532000000000003 | -0.982 | 1.151 | 5.41 |
| 0.536000000000003 | -0.979 | 1.154 | 5.463 |
| 0.540000000000003 | -0.977 | 1.157 | 5.516 |
| 0.544000000000003 | -0.974 | 1.161 | 5.57 |
| 0.548000000000003 | -0.971 | 1.165 | 5.623 |
| 0.552000000000003 | -0.968 | 1.168 | 5.677 |
| 0.556000000000003 | -0.965 | 1.172 | 5.732 |
| 0.560000000000003 | -0.962 | 1.176 | 5.786 |
| 0.564000000000003 | -0.959 | 1.179 | 5.841 |
| 0.568000000000003 | -0.956 | 1.183 | 5.897 |
| 0.572000000000003 | -0.953 | 1.187 | 5.953 |
| 0.576000000000003 | -0.95 | 1.191 | 6.009 |
| 0.580000000000003 | -0.946 | 1.195 | 6.065 |
| 0.584000000000003 | -0.943 | 1.199 | 6.122 |
| 0.588000000000003 | -0.939 | 1.203 | 6.179 |
| 0.592000000000003 | -0.936 | 1.207 | 6.236 |
| 0.596000000000003 | -0.932 | 1.212 | 6.294 |
| 0.600000000000003 | -0.928 | 1.216 | 6.352 |
| 0.604000000000003 | -0.924 | 1.22 | 6.41 |
| 0.608000000000003 | -0.92 | 1.225 | 6.469 |
| 0.612000000000003 | -0.916 | 1.229 | 6.528 |
| 0.616000000000003 | -0.912 | 1.234 | 6.588 |
| 0.620000000000003 | -0.908 | 1.238 | 6.647 |
| 0.624000000000003 | -0.903 | 1.243 | 6.708 |
| 0.628000000000003 | -0.899 | 1.248 | 6.768 |
| 0.632000000000003 | -0.895 | 1.252 | 6.829 |
| 0.636000000000003 | -0.89 | 1.257 | 6.89 |
| 0.640000000000003 | -0.885 | 1.262 | 6.951 |
| 0.644000000000003 | -0.881 | 1.267 | 7.013 |
| 0.648000000000003 | -0.876 | 1.272 | 7.076 |
| 0.652000000000003 | -0.871 | 1.277 | 7.138 |
| 0.656000000000003 | -0.866 | 1.282 | 7.201 |
| 0.660000000000003 | -0.861 | 1.287 | 7.264 |
| 0.664000000000003 | -0.855 | 1.293 | 7.328 |
| 0.668000000000003 | -0.85 | 1.298 | 7.392 |
| 0.672000000000003 | -0.845 | 1.303 | 7.456 |
| 0.676000000000003 | -0.839 | 1.309 | 7.521 |
| 0.680000000000003 | -0.834 | 1.314 | 7.586 |
| 0.684000000000003 | -0.828 | 1.32 | 7.651 |
| 0.688000000000003 | -0.822 | 1.326 | 7.717 |
| 0.692000000000003 | -0.816 | 1.331 | 7.783 |
| 0.696000000000003 | -0.81 | 1.337 | 7.849 |
| 0.700000000000003 | -0.804 | 1.343 | 7.916 |
| 0.704000000000003 | -0.798 | 1.349 | 7.983 |
| 0.708000000000003 | -0.791 | 1.355 | 8.051 |
| 0.712000000000003 | -0.785 | 1.361 | 8.118 |
| 0.716000000000003 | -0.779 | 1.367 | 8.187 |
| 0.720000000000003 | -0.772 | 1.373 | 8.255 |
| 0.724000000000003 | -0.765 | 1.38 | 8.324 |
| 0.728000000000003 | -0.758 | 1.386 | 8.394 |
| 0.732000000000003 | -0.751 | 1.392 | 8.463 |
| 0.736000000000003 | -0.744 | 1.399 | 8.533 |
| 0.740000000000003 | -0.737 | 1.405 | 8.604 |
| 0.744000000000003 | -0.73 | 1.412 | 8.674 |
| 0.748000000000003 | -0.722 | 1.419 | 8.746 |
| 0.752000000000003 | -0.715 | 1.425 | 8.817 |
| 0.756000000000003 | -0.707 | 1.432 | 8.889 |
| 0.760000000000003 | -0.7 | 1.439 | 8.961 |
| 0.764000000000003 | -0.692 | 1.446 | 9.034 |
| 0.768000000000003 | -0.684 | 1.453 | 9.107 |
| 0.772000000000003 | -0.676 | 1.46 | 9.18 |
| 0.776000000000003 | -0.668 | 1.467 | 9.254 |
| 0.780000000000003 | -0.659 | 1.475 | 9.328 |
| 0.784000000000003 | -0.651 | 1.482 | 9.402 |
| 0.788000000000003 | -0.642 | 1.489 | 9.477 |
| 0.792000000000003 | -0.634 | 1.497 | 9.552 |
| 0.796000000000003 | -0.625 | 1.504 | 9.628 |
| 0.800000000000003 | -0.616 | 1.512 | 9.704 |
| 0.804000000000003 | -0.607 | 1.52 | 9.78 |
| 0.808000000000003 | -0.598 | 1.528 | 9.857 |
| 0.812000000000003 | -0.589 | 1.535 | 9.934 |
| 0.816000000000003 | -0.579 | 1.543 | 10.012 |
| 0.820000000000003 | -0.57 | 1.551 | 10.09 |
| 0.824000000000003 | -0.56 | 1.559 | 10.168 |
| 0.828000000000003 | -0.55 | 1.568 | 10.246 |
| 0.832000000000003 | -0.54 | 1.576 | 10.325 |
| 0.836000000000003 | -0.53 | 1.584 | 10.405 |
| 0.840000000000003 | -0.52 | 1.593 | 10.485 |
| 0.844000000000003 | -0.51 | 1.601 | 10.565 |
| 0.848000000000003 | -0.5 | 1.61 | 10.645 |
| 0.852000000000003 | -0.489 | 1.618 | 10.726 |
| 0.856000000000003 | -0.478 | 1.627 | 10.808 |
| 0.860000000000003 | -0.467 | 1.636 | 10.889 |
| 0.864000000000003 | -0.457 | 1.645 | 10.971 |
| 0.868000000000003 | -0.445 | 1.654 | 11.054 |
| 0.872000000000003 | -0.434 | 1.663 | 11.137 |
| 0.876000000000003 | -0.423 | 1.672 | 11.22 |
| 0.880000000000003 | -0.411 | 1.681 | 11.304 |
| 0.884000000000003 | -0.4 | 1.691 | 11.388 |
| 0.888000000000003 | -0.388 | 1.7 | 11.472 |
| 0.892000000000003 | -0.376 | 1.71 | 11.557 |
| 0.896000000000003 | -0.364 | 1.719 | 11.642 |
| 0.900000000000003 | -0.352 | 1.729 | 11.728 |
| 0.904000000000003 | -0.34 | 1.739 | 11.814 |
| 0.908000000000003 | -0.327 | 1.749 | 11.9 |
| 0.912000000000003 | -0.315 | 1.759 | 11.987 |
| 0.916000000000003 | -0.302 | 1.769 | 12.075 |
| 0.920000000000003 | -0.289 | 1.779 | 12.162 |
| 0.924000000000003 | -0.276 | 1.789 | 12.25 |
| 0.928000000000003 | -0.263 | 1.799 | 12.339 |
| 0.932000000000003 | -0.25 | 1.81 | 12.427 |
| 0.936000000000003 | -0.236 | 1.82 | 12.517 |
| 0.940000000000003 | -0.222 | 1.831 | 12.606 |
| 0.944000000000003 | -0.209 | 1.841 | 12.696 |
| 0.948000000000003 | -0.195 | 1.852 | 12.787 |
| 0.952000000000003 | -0.181 | 1.863 | 12.878 |
| 0.956000000000003 | -0.166 | 1.874 | 12.969 |
| 0.960000000000003 | -0.152 | 1.885 | 13.061 |
| 0.964000000000003 | -0.138 | 1.896 | 13.153 |
| 0.968000000000003 | -0.123 | 1.907 | 13.245 |
| 0.972000000000003 | -0.108 | 1.918 | 13.338 |
| 0.976000000000003 | -0.093 | 1.93 | 13.431 |
| 0.980000000000003 | -0.078 | 1.941 | 13.525 |
| 0.984000000000003 | -0.063 | 1.953 | 13.619 |
| 0.988000000000003 | -0.047 | 1.964 | 13.714 |
| 0.992000000000003 | -0.032 | 1.976 | 13.809 |
| 0.996000000000003 | -0.016 | 1.988 | 13.904 |
| 1.000000000000003 | 0 | 2 | 14 |
| 1.004000000000003 | 0.016 | 2.012 | 14.096 |
| 1.008000000000003 | 0.032 | 2.024 | 14.193 |
| 1.012000000000003 | 0.049 | 2.036 | 14.29 |
| 1.016000000000003 | 0.065 | 2.049 | 14.387 |
| 1.020000000000003 | 0.082 | 2.061 | 14.485 |
| 1.024000000000003 | 0.099 | 2.074 | 14.584 |
| 1.028000000000003 | 0.116 | 2.086 | 14.682 |
| 1.032000000000003 | 0.133 | 2.099 | 14.781 |
| 1.036000000000003 | 0.151 | 2.112 | 14.881 |
| 1.040000000000003 | 0.168 | 2.125 | 14.981 |
| 1.044000000000003 | 0.186 | 2.138 | 15.081 |
| 1.048000000000003 | 0.204 | 2.151 | 15.182 |
| 1.052000000000003 | 0.222 | 2.164 | 15.283 |
| 1.056000000000003 | 0.24 | 2.178 | 15.385 |
| 1.060000000000003 | 0.258 | 2.191 | 15.487 |
| 1.064000000000003 | 0.277 | 2.205 | 15.59 |
| 1.068000000000003 | 0.296 | 2.218 | 15.693 |
| 1.072000000000003 | 0.315 | 2.232 | 15.796 |
| 1.076000000000003 | 0.334 | 2.246 | 15.9 |
| 1.080000000000003 | 0.353 | 2.26 | 16.004 |
| 1.084000000000003 | 0.372 | 2.274 | 16.109 |
| 1.088000000000003 | 0.392 | 2.288 | 16.214 |
| 1.092000000000003 | 0.412 | 2.302 | 16.32 |
| 1.096000000000003 | 0.432 | 2.317 | 16.426 |
| 1.100000000000003 | 0.452 | 2.331 | 16.532 |
| 1.104000000000003 | 0.472 | 2.346 | 16.639 |
| 1.108000000000003 | 0.493 | 2.36 | 16.746 |
| 1.112000000000003 | 0.514 | 2.375 | 16.854 |
| 1.116000000000003 | 0.534 | 2.39 | 16.962 |
| 1.120000000000003 | 0.555 | 2.405 | 17.071 |
| 1.124000000000003 | 0.577 | 2.42 | 17.18 |
| 1.128000000000003 | 0.598 | 2.435 | 17.289 |
| 1.132000000000003 | 0.62 | 2.451 | 17.399 |
| 1.136000000000003 | 0.642 | 2.466 | 17.509 |
| 1.140000000000003 | 0.663 | 2.482 | 17.62 |
| 1.144000000000003 | 0.686 | 2.497 | 17.732 |
| 1.148000000000003 | 0.708 | 2.513 | 17.843 |
| 1.152000000000003 | 0.731 | 2.529 | 17.955 |
| 1.156000000000003 | 0.753 | 2.545 | 18.068 |
| 1.160000000000003 | 0.776 | 2.561 | 18.181 |
| 1.164000000000003 | 0.799 | 2.577 | 18.294 |
| 1.168000000000003 | 0.823 | 2.593 | 18.408 |
| 1.172000000000003 | 0.846 | 2.61 | 18.523 |
| 1.176000000000003 | 0.87 | 2.626 | 18.638 |
| 1.180000000000003 | 0.894 | 2.643 | 18.753 |
| 1.184000000000003 | 0.918 | 2.66 | 18.869 |
| 1.188000000000003 | 0.942 | 2.677 | 18.985 |
| 1.192000000000003 | 0.966 | 2.694 | 19.101 |
| 1.196000000000003 | 0.991 | 2.711 | 19.218 |
| 1.200000000000003 | 1.016 | 2.728 | 19.336 |
| 1.204000000000003 | 1.041 | 2.745 | 19.454 |
| 1.208000000000004 | 1.066 | 2.763 | 19.572 |
| 1.212000000000004 | 1.092 | 2.78 | 19.691 |
| 1.216000000000004 | 1.117 | 2.798 | 19.811 |
| 1.220000000000004 | 1.143 | 2.816 | 19.93 |
| 1.224000000000004 | 1.169 | 2.834 | 20.051 |
| 1.228000000000004 | 1.196 | 2.852 | 20.171 |
| 1.232000000000004 | 1.222 | 2.87 | 20.293 |
| 1.236000000000004 | 1.249 | 2.888 | 20.414 |
| 1.240000000000004 | 1.276 | 2.907 | 20.536 |
| 1.244000000000004 | 1.303 | 2.925 | 20.659 |
| 1.248000000000004 | 1.33 | 2.944 | 20.782 |
| 1.252000000000004 | 1.358 | 2.963 | 20.906 |
| 1.256000000000004 | 1.385 | 2.981 | 21.03 |
| 1.260000000000004 | 1.413 | 3 | 21.154 |
| 1.264000000000004 | 1.441 | 3.019 | 21.279 |
| 1.268000000000004 | 1.47 | 3.039 | 21.404 |
| 1.272000000000004 | 1.498 | 3.058 | 21.53 |
| 1.276000000000004 | 1.527 | 3.078 | 21.656 |
| 1.280000000000004 | 1.556 | 3.097 | 21.783 |
| 1.284000000000004 | 1.585 | 3.117 | 21.91 |
| 1.288000000000004 | 1.614 | 3.137 | 22.038 |
| 1.292000000000004 | 1.644 | 3.157 | 22.166 |
| 1.296000000000004 | 1.674 | 3.177 | 22.295 |
| 1.300000000000004 | 1.704 | 3.197 | 22.424 |
| 1.304000000000004 | 1.734 | 3.217 | 22.554 |
| 1.308000000000004 | 1.765 | 3.238 | 22.684 |
| 1.312000000000004 | 1.795 | 3.258 | 22.814 |
| 1.316000000000004 | 1.826 | 3.279 | 22.945 |
| 1.320000000000004 | 1.858 | 3.3 | 23.077 |
| 1.324000000000004 | 1.889 | 3.321 | 23.209 |
| 1.328000000000004 | 1.92 | 3.342 | 23.341 |
| 1.332000000000004 | 1.952 | 3.363 | 23.474 |
| 1.336000000000004 | 1.984 | 3.385 | 23.608 |
| 1.340000000000004 | 2.017 | 3.406 | 23.741 |
| 1.344000000000004 | 2.049 | 3.428 | 23.876 |
| 1.348000000000004 | 2.082 | 3.449 | 24.011 |
| 1.352000000000004 | 2.115 | 3.471 | 24.146 |
| 1.356000000000004 | 2.148 | 3.493 | 24.282 |
| 1.360000000000004 | 2.181 | 3.515 | 24.418 |
| 1.364000000000004 | 2.215 | 3.538 | 24.555 |
| 1.368000000000004 | 2.249 | 3.56 | 24.692 |
| 1.372000000000004 | 2.283 | 3.583 | 24.83 |
| 1.376000000000004 | 2.317 | 3.605 | 24.968 |
| 1.380000000000004 | 2.352 | 3.628 | 25.107 |
| 1.384000000000004 | 2.387 | 3.651 | 25.246 |
| 1.388000000000004 | 2.422 | 3.674 | 25.386 |
| 1.392000000000004 | 2.457 | 3.697 | 25.526 |
| 1.396000000000004 | 2.492 | 3.721 | 25.667 |
| 1.400000000000004 | 2.528 | 3.744 | 25.808 |
| 1.404000000000004 | 2.564 | 3.768 | 25.95 |
| 1.408000000000004 | 2.6 | 3.791 | 26.092 |
| 1.412000000000004 | 2.637 | 3.815 | 26.235 |
| 1.416000000000004 | 2.673 | 3.839 | 26.378 |
| 1.420000000000004 | 2.71 | 3.863 | 26.521 |
| 1.424000000000004 | 2.747 | 3.888 | 26.666 |
| 1.428000000000004 | 2.785 | 3.912 | 26.81 |
| 1.432000000000004 | 2.822 | 3.936 | 26.955 |
| 1.436000000000004 | 2.86 | 3.961 | 27.101 |
| 1.440000000000004 | 2.898 | 3.986 | 27.247 |
| 1.444000000000004 | 2.937 | 4.011 | 27.394 |
| 1.448000000000004 | 2.975 | 4.036 | 27.541 |
| 1.452000000000004 | 3.014 | 4.061 | 27.689 |
| 1.456000000000004 | 3.053 | 4.087 | 27.837 |
| 1.460000000000004 | 3.093 | 4.112 | 27.985 |
| 1.464000000000004 | 3.132 | 4.138 | 28.135 |
| 1.468000000000004 | 3.172 | 4.164 | 28.284 |
| 1.472000000000004 | 3.212 | 4.19 | 28.435 |
| 1.476000000000004 | 3.253 | 4.216 | 28.585 |
| 1.480000000000004 | 3.293 | 4.242 | 28.736 |
| 1.484000000000004 | 3.334 | 4.268 | 28.888 |
| 1.488000000000004 | 3.375 | 4.295 | 29.04 |
| 1.492000000000004 | 3.417 | 4.321 | 29.193 |
| 1.496000000000004 | 3.458 | 4.348 | 29.346 |
| 1.500000000000004 | 3.5 | 4.375 | 29.5 |
| 1.504000000000004 | 3.542 | 4.402 | 29.654 |
| 1.508000000000004 | 3.585 | 4.429 | 29.809 |
| 1.512000000000004 | 3.627 | 4.457 | 29.964 |
| 1.516000000000004 | 3.67 | 4.484 | 30.12 |
| 1.520000000000004 | 3.713 | 4.512 | 30.276 |
| 1.524000000000004 | 3.757 | 4.54 | 30.433 |
| 1.528000000000004 | 3.8 | 4.568 | 30.591 |
| 1.532000000000004 | 3.844 | 4.596 | 30.748 |
| 1.536000000000004 | 3.888 | 4.624 | 30.907 |
| 1.540000000000004 | 3.933 | 4.652 | 31.066 |
| 1.544000000000004 | 3.978 | 4.681 | 31.225 |
| 1.548000000000004 | 4.023 | 4.709 | 31.385 |
| 1.552000000000004 | 4.068 | 4.738 | 31.546 |
| 1.556000000000004 | 4.113 | 4.767 | 31.707 |
| 1.560000000000004 | 4.159 | 4.796 | 31.868 |
| 1.564000000000004 | 4.205 | 4.826 | 32.03 |
| 1.568000000000004 | 4.252 | 4.855 | 32.193 |
| 1.572000000000004 | 4.298 | 4.885 | 32.356 |
| 1.576000000000004 | 4.345 | 4.914 | 32.519 |
| 1.580000000000004 | 4.392 | 4.944 | 32.683 |
| 1.584000000000004 | 4.44 | 4.974 | 32.848 |
| 1.588000000000004 | 4.487 | 5.005 | 33.013 |
| 1.592000000000004 | 4.535 | 5.035 | 33.179 |
| 1.596000000000004 | 4.583 | 5.065 | 33.345 |
| 1.600000000000004 | 4.632 | 5.096 | 33.512 |
| 1.604000000000004 | 4.681 | 5.127 | 33.679 |
| 1.608000000000004 | 4.73 | 5.158 | 33.847 |
| 1.612000000000004 | 4.779 | 5.189 | 34.016 |
| 1.616000000000004 | 4.829 | 5.22 | 34.184 |
| 1.620000000000004 | 4.879 | 5.252 | 34.354 |
| 1.624000000000004 | 4.929 | 5.283 | 34.524 |
| 1.628000000000004 | 4.979 | 5.315 | 34.694 |
| 1.632000000000004 | 5.03 | 5.347 | 34.865 |
| 1.636000000000004 | 5.081 | 5.379 | 35.037 |
| 1.640000000000004 | 5.132 | 5.411 | 35.209 |
| 1.644000000000004 | 5.184 | 5.443 | 35.382 |
| 1.648000000000004 | 5.236 | 5.476 | 35.555 |
| 1.652000000000004 | 5.288 | 5.508 | 35.729 |
| 1.656000000000004 | 5.34 | 5.541 | 35.903 |
| 1.660000000000004 | 5.393 | 5.574 | 36.078 |
| 1.664000000000004 | 5.446 | 5.607 | 36.253 |
| 1.668000000000004 | 5.499 | 5.641 | 36.429 |
| 1.672000000000004 | 5.553 | 5.674 | 36.606 |
| 1.676000000000004 | 5.607 | 5.708 | 36.783 |
| 1.680000000000004 | 5.661 | 5.742 | 36.96 |
| 1.684000000000004 | 5.715 | 5.776 | 37.138 |
| 1.688000000000004 | 5.77 | 5.81 | 37.317 |
| 1.692000000000004 | 5.825 | 5.844 | 37.496 |
| 1.696000000000004 | 5.88 | 5.878 | 37.676 |
| 1.700000000000004 | 5.936 | 5.913 | 37.856 |
| 1.704000000000004 | 5.992 | 5.948 | 38.037 |
| 1.708000000000004 | 6.048 | 5.983 | 38.218 |
| 1.712000000000004 | 6.105 | 6.018 | 38.4 |
| 1.716000000000004 | 6.161 | 6.053 | 38.583 |
| 1.720000000000004 | 6.218 | 6.088 | 38.766 |
| 1.724000000000004 | 6.276 | 6.124 | 38.949 |
| 1.728000000000004 | 6.334 | 6.16 | 39.133 |
| 1.732000000000004 | 6.392 | 6.196 | 39.318 |
| 1.736000000000004 | 6.45 | 6.232 | 39.503 |
| 1.740000000000004 | 6.508 | 6.268 | 39.689 |
| 1.744000000000004 | 6.567 | 6.304 | 39.876 |
| 1.748000000000004 | 6.627 | 6.341 | 40.063 |
| 1.752000000000004 | 6.686 | 6.378 | 40.25 |
| 1.756000000000004 | 6.746 | 6.415 | 40.438 |
| 1.760000000000004 | 6.806 | 6.452 | 40.627 |
| 1.764000000000004 | 6.866 | 6.489 | 40.816 |
| 1.768000000000004 | 6.927 | 6.526 | 41.006 |
| 1.772000000000004 | 6.988 | 6.564 | 41.196 |
| 1.776000000000004 | 7.049 | 6.602 | 41.387 |
| 1.780000000000004 | 7.111 | 6.64 | 41.578 |
| 1.784000000000004 | 7.173 | 6.678 | 41.77 |
| 1.788000000000004 | 7.235 | 6.716 | 41.963 |
| 1.792000000000004 | 7.298 | 6.755 | 42.156 |
| 1.796000000000004 | 7.361 | 6.793 | 42.35 |
| 1.800000000000004 | 7.424 | 6.832 | 42.544 |
| 1.804000000000004 | 7.488 | 6.871 | 42.739 |
| 1.808000000000004 | 7.551 | 6.91 | 42.934 |
| 1.812000000000004 | 7.615 | 6.949 | 43.13 |
| 1.816000000000004 | 7.68 | 6.989 | 43.327 |
| 1.820000000000004 | 7.745 | 7.029 | 43.524 |
| 1.824000000000004 | 7.81 | 7.068 | 43.722 |
| 1.828000000000004 | 7.875 | 7.108 | 43.92 |
| 1.832000000000004 | 7.941 | 7.149 | 44.119 |
| 1.836000000000004 | 8.007 | 7.189 | 44.318 |
| 1.840000000000004 | 8.073 | 7.23 | 44.518 |
| 1.844000000000004 | 8.14 | 7.27 | 44.719 |
| 1.848000000000004 | 8.207 | 7.311 | 44.92 |
| 1.852000000000004 | 8.274 | 7.352 | 45.122 |
| 1.856000000000004 | 8.342 | 7.393 | 45.324 |
| 1.860000000000004 | 8.41 | 7.435 | 45.527 |
| 1.864000000000004 | 8.478 | 7.476 | 45.73 |
| 1.868000000000004 | 8.547 | 7.518 | 45.934 |
| 1.872000000000004 | 8.616 | 7.56 | 46.139 |
| 1.876000000000004 | 8.685 | 7.602 | 46.344 |
| 1.880000000000004 | 8.755 | 7.645 | 46.55 |
| 1.884000000000004 | 8.825 | 7.687 | 46.757 |
| 1.888000000000004 | 8.895 | 7.73 | 46.964 |
| 1.892000000000004 | 8.966 | 7.773 | 47.171 |
| 1.896000000000004 | 9.037 | 7.816 | 47.379 |
| 1.900000000000004 | 9.108 | 7.859 | 47.588 |
| 1.904000000000004 | 9.18 | 7.902 | 47.797 |
| 1.908000000000004 | 9.252 | 7.946 | 48.007 |
| 1.912000000000004 | 9.324 | 7.99 | 48.218 |
| 1.916000000000004 | 9.396 | 8.034 | 48.429 |
| 1.920000000000004 | 9.469 | 8.078 | 48.641 |
| 1.924000000000004 | 9.543 | 8.122 | 48.853 |
| 1.928000000000004 | 9.616 | 8.167 | 49.066 |
| 1.932000000000004 | 9.69 | 8.211 | 49.279 |
| 1.936000000000004 | 9.765 | 8.256 | 49.493 |
| 1.940000000000004 | 9.839 | 8.301 | 49.708 |
| 1.944000000000004 | 9.914 | 8.347 | 49.923 |
| 1.948000000000004 | 9.989 | 8.392 | 50.139 |
| 1.952000000000004 | 10.065 | 8.438 | 50.356 |
| 1.956000000000004 | 10.141 | 8.484 | 50.573 |
| 1.960000000000004 | 10.217 | 8.53 | 50.79 |
| 1.964000000000004 | 10.294 | 8.576 | 51.009 |
| 1.968000000000004 | 10.371 | 8.622 | 51.227 |
| 1.972000000000004 | 10.449 | 8.669 | 51.447 |
| 1.976000000000004 | 10.526 | 8.715 | 51.667 |
| 1.980000000000004 | 10.604 | 8.762 | 51.888 |
| 1.984000000000004 | 10.683 | 8.81 | 52.109 |
| 1.988000000000004 | 10.762 | 8.857 | 52.331 |
| 1.992000000000004 | 10.841 | 8.904 | 52.553 |
| 1.996000000000004 | 10.92 | 8.952 | 52.776 |
| 2.000000000000004 | 11 | 9 | 53 |
| 2.004000000000004 | 11.08 | 9.048 | 53.224 |
| 2.008000000000004 | 11.161 | 9.096 | 53.449 |
| 2.012000000000004 | 11.242 | 9.145 | 53.675 |
| 2.016000000000004 | 11.323 | 9.194 | 53.901 |
| 2.020000000000004 | 11.404 | 9.242 | 54.128 |
| 2.024000000000004 | 11.486 | 9.291 | 54.355 |
| 2.028000000000004 | 11.569 | 9.341 | 54.583 |
| 2.032000000000004 | 11.651 | 9.39 | 54.812 |
| 2.036000000000004 | 11.734 | 9.44 | 55.041 |
| 2.040000000000004 | 11.818 | 9.49 | 55.271 |
| 2.044000000000004 | 11.901 | 9.54 | 55.501 |
| 2.048000000000004 | 11.986 | 9.59 | 55.732 |
| 2.052000000000004 | 12.07 | 9.64 | 55.964 |
| 2.056000000000004 | 12.155 | 9.691 | 56.196 |
| 2.060000000000004 | 12.24 | 9.742 | 56.429 |
| 2.064000000000004 | 12.326 | 9.793 | 56.662 |
| 2.068000000000004 | 12.411 | 9.844 | 56.896 |
| 2.072000000000004 | 12.498 | 9.895 | 57.131 |
| 2.076000000000004 | 12.584 | 9.947 | 57.367 |
| 2.080000000000004 | 12.671 | 9.999 | 57.603 |
| 2.084000000000004 | 12.759 | 10.051 | 57.839 |
| 2.088000000000004 | 12.847 | 10.103 | 58.076 |
| 2.092000000000004 | 12.935 | 10.156 | 58.314 |
| 2.096000000000004 | 13.023 | 10.208 | 58.553 |
| 2.100000000000004 | 13.112 | 10.261 | 58.792 |
| 2.104000000000004 | 13.201 | 10.314 | 59.032 |
| 2.108000000000004 | 13.291 | 10.367 | 59.272 |
| 2.112000000000004 | 13.381 | 10.421 | 59.513 |
| 2.116000000000004 | 13.471 | 10.474 | 59.755 |
| 2.120000000000004 | 13.562 | 10.528 | 59.997 |
| 2.124000000000004 | 13.653 | 10.582 | 60.24 |
| 2.128000000000004 | 13.744 | 10.636 | 60.483 |
| 2.132000000000004 | 13.836 | 10.691 | 60.728 |
| 2.136000000000004 | 13.928 | 10.745 | 60.972 |
| 2.140000000000004 | 14.021 | 10.8 | 61.218 |
| 2.144000000000004 | 14.114 | 10.855 | 61.464 |
| 2.148000000000004 | 14.207 | 10.911 | 61.711 |
| 2.152000000000004 | 14.301 | 10.966 | 61.958 |
| 2.156000000000004 | 14.395 | 11.022 | 62.206 |
| 2.160000000000004 | 14.49 | 11.078 | 62.455 |
| 2.164000000000004 | 14.585 | 11.134 | 62.704 |
| 2.168000000000004 | 14.68 | 11.19 | 62.954 |
| 2.172000000000004 | 14.776 | 11.247 | 63.204 |
| 2.176000000000004 | 14.872 | 11.303 | 63.455 |
| 2.180000000000004 | 14.968 | 11.36 | 63.707 |
| 2.184000000000004 | 15.065 | 11.417 | 63.96 |
| 2.188000000000004 | 15.162 | 11.475 | 64.213 |
| 2.192000000000004 | 15.26 | 11.532 | 64.467 |
| 2.196000000000004 | 15.358 | 11.59 | 64.721 |
| 2.200000000000004 | 15.456 | 11.648 | 64.976 |
| 2.204000000000004 | 15.555 | 11.706 | 65.232 |
| 2.208000000000004 | 15.654 | 11.765 | 65.488 |
| 2.212000000000004 | 15.753 | 11.823 | 65.745 |
| 2.216000000000004 | 15.853 | 11.882 | 66.003 |
| 2.220000000000004 | 15.954 | 11.941 | 66.261 |
| 2.224000000000004 | 16.054 | 12 | 66.52 |
| 2.228000000000004 | 16.156 | 12.06 | 66.779 |
| 2.232000000000004 | 16.257 | 12.119 | 67.04 |
| 2.236000000000004 | 16.359 | 12.179 | 67.301 |
| 2.240000000000004 | 16.461 | 12.239 | 67.562 |
| 2.244000000000004 | 16.564 | 12.3 | 67.824 |
| 2.248000000000004 | 16.667 | 12.36 | 68.087 |
| 2.252000000000004 | 16.771 | 12.421 | 68.351 |
| 2.256000000000004 | 16.874 | 12.482 | 68.615 |
| 2.260000000000004 | 16.979 | 12.543 | 68.88 |
| 2.264000000000004 | 17.083 | 12.605 | 69.145 |
| 2.268000000000004 | 17.189 | 12.666 | 69.411 |
| 2.272000000000004 | 17.294 | 12.728 | 69.678 |
| 2.276000000000004 | 17.4 | 12.79 | 69.945 |
| 2.280000000000004 | 17.506 | 12.852 | 70.214 |
| 2.284000000000004 | 17.613 | 12.915 | 70.482 |
| 2.288000000000004 | 17.72 | 12.978 | 70.752 |
| 2.292000000000004 | 17.828 | 13.04 | 71.022 |
| 2.296000000000004 | 17.936 | 13.104 | 71.293 |
| 2.300000000000004 | 18.044 | 13.167 | 71.564 |
| 2.304000000000004 | 18.153 | 13.231 | 71.836 |
| 2.308000000000004 | 18.262 | 13.294 | 72.109 |
| 2.312000000000004 | 18.372 | 13.358 | 72.382 |
| 2.316000000000004 | 18.482 | 13.423 | 72.656 |
| 2.320000000000004 | 18.592 | 13.487 | 72.931 |
| 2.324000000000004 | 18.703 | 13.552 | 73.207 |
| 2.328000000000004 | 18.814 | 13.617 | 73.483 |
| 2.332000000000004 | 18.926 | 13.682 | 73.759 |
| 2.336000000000004 | 19.038 | 13.747 | 74.037 |
| 2.340000000000004 | 19.15 | 13.813 | 74.315 |
| 2.344000000000004 | 19.263 | 13.879 | 74.594 |
| 2.348000000000004 | 19.376 | 13.945 | 74.873 |
| 2.352000000000004 | 19.49 | 14.011 | 75.153 |
| 2.356000000000004 | 19.604 | 14.078 | 75.434 |
| 2.360000000000004 | 19.719 | 14.144 | 75.716 |
| 2.364000000000004 | 19.834 | 14.211 | 75.998 |
| 2.368000000000004 | 19.949 | 14.278 | 76.281 |
| 2.372000000000004 | 20.065 | 14.346 | 76.564 |
| 2.376000000000004 | 20.181 | 14.413 | 76.848 |
| 2.380000000000004 | 20.298 | 14.481 | 77.133 |
| 2.384000000000004 | 20.415 | 14.549 | 77.419 |
| 2.388000000000004 | 20.533 | 14.618 | 77.705 |
| 2.392000000000004 | 20.651 | 14.686 | 77.992 |
| 2.396000000000004 | 20.769 | 14.755 | 78.28 |
| 2.400000000000004 | 20.888 | 14.824 | 78.568 |
| 2.404000000000004 | 21.007 | 14.893 | 78.857 |
| 2.408000000000004 | 21.127 | 14.963 | 79.147 |
| 2.412000000000004 | 21.247 | 15.032 | 79.437 |
| 2.416000000000004 | 21.368 | 15.102 | 79.728 |
| 2.420000000000004 | 21.489 | 15.172 | 80.02 |
| 2.424000000000004 | 21.61 | 15.243 | 80.312 |
| 2.428000000000004 | 21.732 | 15.314 | 80.605 |
| 2.432000000000004 | 21.854 | 15.384 | 80.899 |
| 2.436000000000004 | 21.977 | 15.455 | 81.194 |
| 2.440000000000004 | 22.1 | 15.527 | 81.489 |
| 2.444000000000004 | 22.224 | 15.598 | 81.785 |
| 2.448000000000004 | 22.348 | 15.67 | 82.081 |
| 2.452000000000004 | 22.472 | 15.742 | 82.378 |
| 2.456000000000004 | 22.597 | 15.814 | 82.676 |
| 2.460000000000004 | 22.722 | 15.887 | 82.975 |
| 2.464000000000004 | 22.848 | 15.96 | 83.274 |
| 2.468000000000004 | 22.974 | 16.033 | 83.574 |
| 2.472000000000004 | 23.101 | 16.106 | 83.875 |
| 2.476000000000004 | 23.228 | 16.179 | 84.177 |
| 2.480000000000004 | 23.356 | 16.253 | 84.479 |
| 2.484000000000004 | 23.484 | 16.327 | 84.782 |
| 2.488000000000004 | 23.612 | 16.401 | 85.085 |
| 2.492000000000004 | 23.741 | 16.475 | 85.389 |
| 2.496000000000004 | 23.87 | 16.55 | 85.694 |
| 2.500000000000004 | 24 | 16.625 | 86 |
| 2.504000000000004 | 24.13 | 16.7 | 86.306 |
| 2.508000000000004 | 24.261 | 16.775 | 86.613 |
| 2.512000000000004 | 24.392 | 16.851 | 86.921 |
| 2.516000000000004 | 24.524 | 16.927 | 87.23 |
| 2.520000000000004 | 24.656 | 17.003 | 87.539 |
| 2.524000000000004 | 24.788 | 17.079 | 87.849 |
| 2.528000000000004 | 24.921 | 17.156 | 88.159 |
| 2.532000000000004 | 25.054 | 17.233 | 88.471 |
| 2.536000000000004 | 25.188 | 17.31 | 88.783 |
| 2.540000000000004 | 25.323 | 17.387 | 89.095 |
| 2.544000000000004 | 25.457 | 17.465 | 89.409 |
| 2.548000000000004 | 25.592 | 17.542 | 89.723 |
| 2.552000000000004 | 25.728 | 17.62 | 90.038 |
| 2.556000000000004 | 25.864 | 17.699 | 90.353 |
| 2.560000000000004 | 26.001 | 17.777 | 90.67 |
| 2.564000000000004 | 26.138 | 17.856 | 90.987 |
| 2.568000000000004 | 26.275 | 17.935 | 91.304 |
| 2.572000000000004 | 26.413 | 18.014 | 91.623 |
| 2.576000000000004 | 26.552 | 18.094 | 91.942 |
| 2.580000000000004 | 26.691 | 18.174 | 92.262 |
| 2.584000000000004 | 26.83 | 18.254 | 92.582 |
| 2.588000000000005 | 26.97 | 18.334 | 92.904 |
| 2.592000000000004 | 27.11 | 18.414 | 93.226 |
| 2.596000000000004 | 27.251 | 18.495 | 93.549 |
| 2.600000000000004 | 27.392 | 18.576 | 93.872 |
| 2.604000000000004 | 27.534 | 18.657 | 94.196 |
| 2.608000000000004 | 27.676 | 18.739 | 94.521 |
| 2.612000000000004 | 27.818 | 18.82 | 94.847 |
| 2.616000000000004 | 27.962 | 18.902 | 95.173 |
| 2.620000000000004 | 28.105 | 18.985 | 95.5 |
| 2.624000000000004 | 28.249 | 19.067 | 95.828 |
| 2.628000000000004 | 28.394 | 19.15 | 96.157 |
| 2.632000000000004 | 28.539 | 19.233 | 96.486 |
| 2.636000000000004 | 28.684 | 19.316 | 96.816 |
| 2.640000000000004 | 28.83 | 19.4 | 97.147 |
| 2.644000000000004 | 28.976 | 19.484 | 97.478 |
| 2.648000000000004 | 29.123 | 19.568 | 97.81 |
| 2.652000000000004 | 29.27 | 19.652 | 98.143 |
| 2.656000000000004 | 29.418 | 19.736 | 98.477 |
| 2.660000000000004 | 29.567 | 19.821 | 98.811 |
| 2.664000000000004 | 29.715 | 19.906 | 99.147 |
| 2.668000000000004 | 29.865 | 19.991 | 99.482 |
| 2.672000000000004 | 30.014 | 20.077 | 99.819 |
| 2.676000000000004 | 30.165 | 20.163 | 100.156 |
| 2.680000000000004 | 30.315 | 20.249 | 100.494 |
| 2.684000000000004 | 30.466 | 20.335 | 100.833 |
| 2.688000000000005 | 30.618 | 20.422 | 101.173 |
| 2.692000000000004 | 30.77 | 20.509 | 101.513 |
| 2.696000000000004 | 30.923 | 20.596 | 101.854 |
| 2.700000000000005 | 31.076 | 20.683 | 102.196 |
| 2.704000000000005 | 31.23 | 20.771 | 102.539 |
| 2.708000000000005 | 31.384 | 20.858 | 102.882 |
| 2.712000000000005 | 31.538 | 20.947 | 103.226 |
| 2.716000000000005 | 31.693 | 21.035 | 103.571 |
| 2.720000000000005 | 31.849 | 21.124 | 103.916 |
| 2.724000000000005 | 32.005 | 21.213 | 104.262 |
| 2.728000000000005 | 32.161 | 21.302 | 104.609 |
| 2.732000000000005 | 32.319 | 21.391 | 104.957 |
| 2.736000000000005 | 32.476 | 21.481 | 105.306 |
| 2.740000000000005 | 32.634 | 21.571 | 105.655 |
| 2.744000000000005 | 32.793 | 21.661 | 106.005 |
| 2.748000000000005 | 32.952 | 21.752 | 106.356 |
| 2.752000000000005 | 33.111 | 21.842 | 106.707 |
| 2.756000000000005 | 33.271 | 21.933 | 107.059 |
| 2.760000000000005 | 33.432 | 22.025 | 107.412 |
| 2.764000000000005 | 33.593 | 22.116 | 107.766 |
| 2.768000000000005 | 33.754 | 22.208 | 108.121 |
| 2.772000000000005 | 33.916 | 22.3 | 108.476 |
| 2.776000000000005 | 34.079 | 22.392 | 108.832 |
| 2.780000000000005 | 34.242 | 22.485 | 109.189 |
| 2.784000000000005 | 34.405 | 22.578 | 109.546 |
| 2.788000000000005 | 34.569 | 22.671 | 109.905 |
| 2.792000000000005 | 34.733 | 22.764 | 110.264 |
| 2.796000000000005 | 34.898 | 22.858 | 110.623 |
| 2.800000000000005 | 35.064 | 22.952 | 110.984 |
| 2.804000000000005 | 35.23 | 23.046 | 111.345 |
| 2.808000000000005 | 35.397 | 23.141 | 111.707 |
| 2.812000000000005 | 35.564 | 23.235 | 112.07 |
| 2.816000000000005 | 35.731 | 23.33 | 112.434 |
| 2.820000000000005 | 35.899 | 23.426 | 112.798 |
| 2.824000000000005 | 36.068 | 23.521 | 113.163 |
| 2.828000000000005 | 36.237 | 23.617 | 113.529 |
| 2.832000000000005 | 36.406 | 23.713 | 113.896 |
| 2.836000000000005 | 36.576 | 23.81 | 114.264 |
| 2.840000000000005 | 36.747 | 23.906 | 114.632 |
| 2.844000000000005 | 36.918 | 24.003 | 115.001 |
| 2.848000000000005 | 37.09 | 24.1 | 115.371 |
| 2.852000000000005 | 37.262 | 24.198 | 115.741 |
| 2.856000000000005 | 37.435 | 24.296 | 116.112 |
| 2.860000000000005 | 37.608 | 24.394 | 116.485 |
| 2.864000000000005 | 37.781 | 24.492 | 116.857 |
| 2.868000000000005 | 37.956 | 24.591 | 117.231 |
| 2.872000000000005 | 38.13 | 24.689 | 117.605 |
| 2.876000000000005 | 38.306 | 24.788 | 117.981 |
| 2.880000000000005 | 38.481 | 24.888 | 118.357 |
| 2.884000000000005 | 38.658 | 24.988 | 118.733 |
| 2.888000000000005 | 38.834 | 25.087 | 119.111 |
| 2.892000000000005 | 39.012 | 25.188 | 119.489 |
| 2.896000000000005 | 39.19 | 25.288 | 119.868 |
| 2.900000000000005 | 39.368 | 25.389 | 120.248 |
| 2.904000000000005 | 39.547 | 25.49 | 120.629 |
| 2.908000000000005 | 39.726 | 25.591 | 121.01 |
| 2.912000000000005 | 39.906 | 25.693 | 121.392 |
| 2.916000000000005 | 40.087 | 25.795 | 121.775 |
| 2.920000000000005 | 40.268 | 25.897 | 122.159 |
| 2.924000000000005 | 40.449 | 26 | 122.544 |
| 2.928000000000005 | 40.631 | 26.102 | 122.929 |
| 2.932000000000005 | 40.814 | 26.205 | 123.315 |
| 2.936000000000005 | 40.997 | 26.309 | 123.702 |
| 2.940000000000005 | 41.181 | 26.412 | 124.09 |
| 2.944000000000005 | 41.365 | 26.516 | 124.478 |
| 2.948000000000005 | 41.55 | 26.62 | 124.867 |
| 2.952000000000005 | 41.735 | 26.725 | 125.257 |
| 2.956000000000005 | 41.921 | 26.829 | 125.648 |
| 2.960000000000005 | 42.107 | 26.934 | 126.04 |
| 2.964000000000005 | 42.294 | 27.04 | 126.432 |
| 2.968000000000005 | 42.481 | 27.145 | 126.826 |
| 2.972000000000005 | 42.669 | 27.251 | 127.22 |
| 2.976000000000005 | 42.858 | 27.357 | 127.614 |
| 2.980000000000005 | 43.047 | 27.464 | 128.01 |
| 2.984000000000005 | 43.236 | 27.57 | 128.406 |
| 2.988000000000005 | 43.426 | 27.677 | 128.804 |
| 2.992000000000005 | 43.617 | 27.785 | 129.202 |
| 2.996000000000005 | 43.808 | 27.892 | 129.6 |
| 3.000000000000005 | 44 | 28 | 130 |
| 3.004000000000005 | 44.192 | 28.108 | 130.4 |
| 3.008000000000005 | 44.385 | 28.217 | 130.802 |
| 3.012000000000005 | 44.578 | 28.325 | 131.204 |
| 3.016000000000005 | 44.772 | 28.434 | 131.606 |
| 3.020000000000005 | 44.967 | 28.544 | 132.01 |
| 3.024000000000005 | 45.162 | 28.653 | 132.414 |
| 3.028000000000005 | 45.357 | 28.763 | 132.82 |
| 3.032000000000005 | 45.553 | 28.873 | 133.226 |
| 3.036000000000005 | 45.75 | 28.984 | 133.632 |
| 3.040000000000005 | 45.947 | 29.094 | 134.04 |
| 3.044000000000005 | 46.145 | 29.206 | 134.449 |
| 3.048000000000005 | 46.343 | 29.317 | 134.858 |
| 3.052000000000005 | 46.542 | 29.428 | 135.268 |
| 3.056000000000005 | 46.742 | 29.54 | 135.679 |
| 3.060000000000005 | 46.942 | 29.653 | 136.09 |
| 3.064000000000005 | 47.142 | 29.765 | 136.503 |
| 3.068000000000005 | 47.343 | 29.878 | 136.916 |
| 3.072000000000005 | 47.545 | 29.991 | 137.33 |
| 3.076000000000005 | 47.747 | 30.104 | 137.745 |
| 3.080000000000005 | 47.95 | 30.218 | 138.161 |
| 3.084000000000005 | 48.153 | 30.332 | 138.578 |
| 3.088000000000005 | 48.357 | 30.446 | 138.995 |
| 3.092000000000005 | 48.561 | 30.561 | 139.413 |
| 3.096000000000005 | 48.766 | 30.676 | 139.832 |
| 3.100000000000005 | 48.972 | 30.791 | 140.252 |
| 3.104000000000005 | 49.178 | 30.906 | 140.673 |
| 3.108000000000005 | 49.385 | 31.022 | 141.094 |
| 3.112000000000005 | 49.592 | 31.138 | 141.516 |
| 3.116000000000005 | 49.8 | 31.255 | 141.94 |
| 3.120000000000005 | 50.008 | 31.371 | 142.363 |
| 3.124000000000005 | 50.217 | 31.488 | 142.788 |
| 3.128000000000005 | 50.427 | 31.606 | 143.214 |
| 3.132000000000005 | 50.637 | 31.723 | 143.64 |
| 3.136000000000005 | 50.847 | 31.841 | 144.067 |
| 3.140000000000005 | 51.059 | 31.959 | 144.495 |
| 3.144000000000005 | 51.27 | 32.078 | 144.924 |
| 3.148000000000005 | 51.483 | 32.196 | 145.354 |
| 3.152000000000005 | 51.696 | 32.315 | 145.785 |
| 3.156000000000005 | 51.909 | 32.435 | 146.216 |
| 3.160000000000005 | 52.123 | 32.554 | 146.648 |
| 3.164000000000005 | 52.338 | 32.674 | 147.081 |
| 3.168000000000005 | 52.553 | 32.795 | 147.515 |
| 3.172000000000005 | 52.769 | 32.915 | 147.95 |
| 3.176000000000005 | 52.985 | 33.036 | 148.385 |
| 3.180000000000005 | 53.202 | 33.157 | 148.822 |
| 3.184000000000005 | 53.42 | 33.279 | 149.259 |
| 3.188000000000005 | 53.638 | 33.401 | 149.697 |
| 3.192000000000005 | 53.857 | 33.523 | 150.136 |
| 3.196000000000005 | 54.076 | 33.645 | 150.575 |
| 3.200000000000005 | 54.296 | 33.768 | 151.016 |
| 3.204000000000005 | 54.516 | 33.891 | 151.457 |
| 3.208000000000005 | 54.737 | 34.014 | 151.9 |
| 3.212000000000005 | 54.959 | 34.138 | 152.343 |
| 3.216000000000005 | 55.181 | 34.262 | 152.787 |
| 3.220000000000005 | 55.404 | 34.386 | 153.231 |
| 3.224000000000005 | 55.627 | 34.511 | 153.677 |
| 3.228000000000005 | 55.851 | 34.636 | 154.123 |
| 3.232000000000005 | 56.076 | 34.761 | 154.571 |
| 3.236000000000005 | 56.301 | 34.886 | 155.019 |
| 3.240000000000005 | 56.527 | 35.012 | 155.468 |
| 3.244000000000005 | 56.753 | 35.138 | 155.917 |
| 3.248000000000005 | 56.98 | 35.265 | 156.368 |
| 3.252000000000005 | 57.208 | 35.392 | 156.82 |
| 3.256000000000005 | 57.436 | 35.519 | 157.272 |
| 3.260000000000005 | 57.664 | 35.646 | 157.725 |
| 3.264000000000005 | 57.894 | 35.774 | 158.179 |
| 3.268000000000005 | 58.124 | 35.902 | 158.634 |
| 3.272000000000005 | 58.354 | 36.03 | 159.09 |
| 3.276000000000005 | 58.585 | 36.159 | 159.546 |
| 3.280000000000005 | 58.817 | 36.288 | 160.004 |
| 3.284000000000005 | 59.049 | 36.417 | 160.462 |
| 3.288000000000005 | 59.282 | 36.546 | 160.921 |
| 3.292000000000005 | 59.515 | 36.676 | 161.381 |
| 3.296000000000005 | 59.749 | 36.806 | 161.842 |
| 3.300000000000005 | 59.984 | 36.937 | 162.304 |
| 3.304000000000005 | 60.219 | 37.068 | 162.767 |
| 3.308000000000005 | 60.455 | 37.199 | 163.23 |
| 3.312000000000005 | 60.692 | 37.33 | 163.694 |
| 3.316000000000005 | 60.929 | 37.462 | 164.16 |
| 3.320000000000005 | 61.166 | 37.594 | 164.626 |
| 3.324000000000005 | 61.405 | 37.727 | 165.092 |
| 3.328000000000005 | 61.644 | 37.86 | 165.56 |
| 3.332000000000005 | 61.883 | 37.993 | 166.029 |
| 3.336000000000005 | 62.123 | 38.126 | 166.498 |
| 3.340000000000005 | 62.364 | 38.26 | 166.969 |
| 3.344000000000005 | 62.605 | 38.394 | 167.44 |
| 3.348000000000005 | 62.847 | 38.528 | 167.912 |
| 3.352000000000005 | 63.09 | 38.663 | 168.385 |
| 3.356000000000005 | 63.333 | 38.798 | 168.859 |
| 3.360000000000005 | 63.577 | 38.933 | 169.333 |
| 3.364000000000005 | 63.821 | 39.069 | 169.809 |
| 3.368000000000005 | 64.066 | 39.205 | 170.285 |
| 3.372000000000005 | 64.311 | 39.341 | 170.763 |
| 3.376000000000005 | 64.558 | 39.478 | 171.241 |
| 3.380000000000005 | 64.805 | 39.614 | 171.72 |
| 3.384000000000005 | 65.052 | 39.752 | 172.2 |
| 3.388000000000005 | 65.3 | 39.889 | 172.68 |
| 3.392000000000005 | 65.549 | 40.027 | 173.162 |
| 3.396000000000005 | 65.798 | 40.165 | 173.645 |
| 3.400000000000005 | 66.048 | 40.304 | 174.128 |
| 3.404000000000005 | 66.299 | 40.443 | 174.612 |
| 3.408000000000005 | 66.55 | 40.582 | 175.097 |
| 3.412000000000005 | 66.802 | 40.722 | 175.583 |
| 3.416000000000005 | 67.054 | 40.861 | 176.07 |
| 3.420000000000005 | 67.307 | 41.002 | 176.558 |
| 3.424000000000005 | 67.561 | 41.142 | 177.047 |
| 3.428000000000005 | 67.815 | 41.283 | 177.536 |
| 3.432000000000005 | 68.07 | 41.424 | 178.027 |
| 3.436000000000005 | 68.325 | 41.566 | 178.518 |
| 3.440000000000005 | 68.582 | 41.708 | 179.01 |
| 3.444000000000005 | 68.838 | 41.85 | 179.503 |
| 3.448000000000005 | 69.096 | 41.992 | 179.997 |
| 3.452000000000005 | 69.354 | 42.135 | 180.492 |
| 3.456000000000005 | 69.613 | 42.278 | 180.988 |
| 3.460000000000005 | 69.872 | 42.422 | 181.485 |
| 3.464000000000005 | 70.132 | 42.566 | 181.982 |
| 3.468000000000005 | 70.392 | 42.71 | 182.481 |
| 3.472000000000005 | 70.654 | 42.854 | 182.98 |
| 3.476000000000005 | 70.915 | 42.999 | 183.48 |
| 3.480000000000005 | 71.178 | 43.144 | 183.981 |
| 3.484000000000005 | 71.441 | 43.29 | 184.483 |
| 3.488000000000005 | 71.705 | 43.436 | 184.986 |
| 3.492000000000005 | 71.969 | 43.582 | 185.49 |
| 3.496000000000005 | 72.234 | 43.728 | 185.994 |
| 3.500000000000005 | 72.5 | 43.875 | 186.5 |
| 3.504000000000005 | 72.766 | 44.022 | 187.006 |
| 3.508000000000005 | 73.033 | 44.17 | 187.514 |
| 3.512000000000005 | 73.301 | 44.318 | 188.022 |
| 3.516000000000005 | 73.569 | 44.466 | 188.531 |
| 3.520000000000005 | 73.838 | 44.614 | 189.041 |
| 3.524000000000005 | 74.108 | 44.763 | 189.552 |
| 3.528000000000005 | 74.378 | 44.912 | 190.064 |
| 3.532000000000005 | 74.649 | 45.062 | 190.577 |
| 3.536000000000005 | 74.92 | 45.212 | 191.09 |
| 3.540000000000005 | 75.192 | 45.362 | 191.605 |
| 3.544000000000005 | 75.465 | 45.512 | 192.12 |
| 3.548000000000005 | 75.738 | 45.663 | 192.637 |
| 3.552000000000005 | 76.012 | 45.815 | 193.154 |
| 3.556000000000005 | 76.287 | 45.966 | 193.672 |
| 3.560000000000005 | 76.562 | 46.118 | 194.191 |
| 3.564000000000005 | 76.838 | 46.27 | 194.711 |
| 3.568000000000005 | 77.115 | 46.423 | 195.232 |
| 3.572000000000005 | 77.392 | 46.576 | 195.754 |
| 3.576000000000005 | 77.67 | 46.729 | 196.277 |
| 3.580000000000005 | 77.949 | 46.883 | 196.8 |
| 3.584000000000005 | 78.228 | 47.037 | 197.325 |
| 3.588000000000005 | 78.508 | 47.191 | 197.85 |
| 3.592000000000005 | 78.789 | 47.346 | 198.377 |
| 3.596000000000005 | 79.07 | 47.501 | 198.904 |
| 3.600000000000005 | 79.352 | 47.656 | 199.432 |
| 3.604000000000005 | 79.635 | 47.812 | 199.961 |
| 3.608000000000005 | 79.918 | 47.968 | 200.491 |
| 3.612000000000005 | 80.202 | 48.124 | 201.022 |
| 3.616000000000005 | 80.486 | 48.281 | 201.554 |
| 3.620000000000005 | 80.771 | 48.438 | 202.087 |
| 3.624000000000005 | 81.057 | 48.595 | 202.62 |
| 3.628000000000005 | 81.344 | 48.753 | 203.155 |
| 3.632000000000005 | 81.631 | 48.911 | 203.69 |
| 3.636000000000005 | 81.919 | 49.07 | 204.227 |
| 3.640000000000005 | 82.207 | 49.229 | 204.764 |
| 3.644000000000005 | 82.497 | 49.388 | 205.303 |
| 3.648000000000005 | 82.787 | 49.547 | 205.842 |
| 3.652000000000005 | 83.077 | 49.707 | 206.382 |
| 3.656000000000005 | 83.368 | 49.867 | 206.923 |
| 3.660000000000005 | 83.66 | 50.028 | 207.465 |
| 3.664000000000005 | 83.953 | 50.189 | 208.008 |
| 3.668000000000005 | 84.246 | 50.35 | 208.552 |
| 3.672000000000005 | 84.54 | 50.512 | 209.097 |
| 3.676000000000005 | 84.834 | 50.674 | 209.642 |
| 3.680000000000005 | 85.13 | 50.836 | 210.189 |
| 3.684000000000005 | 85.426 | 50.999 | 210.736 |
| 3.688000000000005 | 85.722 | 51.162 | 211.285 |
| 3.692000000000005 | 86.019 | 51.325 | 211.834 |
| 3.696000000000005 | 86.317 | 51.489 | 212.385 |
| 3.700000000000005 | 86.616 | 51.653 | 212.936 |
| 3.704000000000005 | 86.915 | 51.817 | 213.488 |
| 3.708000000000005 | 87.215 | 51.982 | 214.041 |
| 3.712000000000005 | 87.516 | 52.147 | 214.595 |
| 3.716000000000005 | 87.817 | 52.313 | 215.151 |
| 3.720000000000005 | 88.119 | 52.479 | 215.706 |
| 3.724000000000005 | 88.422 | 52.645 | 216.263 |
| 3.728000000000005 | 88.725 | 52.812 | 216.821 |
| 3.732000000000005 | 89.029 | 52.979 | 217.38 |
| 3.736000000000005 | 89.334 | 53.146 | 217.94 |
| 3.740000000000005 | 89.64 | 53.314 | 218.5 |
| 3.744000000000005 | 89.946 | 53.482 | 219.062 |
| 3.748000000000005 | 90.253 | 53.65 | 219.625 |
| 3.752000000000005 | 90.56 | 53.819 | 220.188 |
| 3.756000000000005 | 90.868 | 53.988 | 220.753 |
| 3.760000000000005 | 91.177 | 54.157 | 221.318 |
| 3.764000000000005 | 91.487 | 54.327 | 221.884 |
| 3.768000000000005 | 91.797 | 54.497 | 222.452 |
| 3.772000000000005 | 92.108 | 54.668 | 223.02 |
| 3.776000000000005 | 92.42 | 54.839 | 223.589 |
| 3.780000000000005 | 92.732 | 55.01 | 224.159 |
| 3.784000000000005 | 93.045 | 55.182 | 224.73 |
| 3.788000000000006 | 93.359 | 55.354 | 225.302 |
| 3.792000000000005 | 93.673 | 55.526 | 225.875 |
| 3.796000000000005 | 93.988 | 55.699 | 226.449 |
| 3.800000000000006 | 94.304 | 55.872 | 227.024 |
| 3.804000000000006 | 94.621 | 56.045 | 227.6 |
| 3.808000000000006 | 94.938 | 56.219 | 228.177 |
| 3.812000000000006 | 95.256 | 56.393 | 228.754 |
| 3.816000000000006 | 95.574 | 56.568 | 229.333 |
| 3.820000000000006 | 95.894 | 56.743 | 229.913 |
| 3.824000000000006 | 96.214 | 56.918 | 230.493 |
| 3.828000000000006 | 96.534 | 57.094 | 231.075 |
| 3.832000000000006 | 96.856 | 57.27 | 231.657 |
| 3.836000000000006 | 97.178 | 57.446 | 232.241 |
| 3.840000000000006 | 97.501 | 57.623 | 232.825 |
| 3.844000000000006 | 97.824 | 57.8 | 233.411 |
| 3.848000000000006 | 98.148 | 57.978 | 233.997 |
| 3.852000000000006 | 98.473 | 58.156 | 234.585 |
| 3.856000000000006 | 98.799 | 58.334 | 235.173 |
| 3.860000000000006 | 99.125 | 58.512 | 235.762 |
| 3.864000000000006 | 99.452 | 58.691 | 236.352 |
| 3.868000000000006 | 99.78 | 58.871 | 236.944 |
| 3.872000000000006 | 100.109 | 59.051 | 237.536 |
| 3.876000000000006 | 100.438 | 59.231 | 238.129 |
| 3.880000000000006 | 100.768 | 59.411 | 238.723 |
| 3.884000000000006 | 101.098 | 59.592 | 239.318 |
| 3.888000000000006 | 101.43 | 59.773 | 239.914 |
| 3.892000000000006 | 101.762 | 59.955 | 240.511 |
| 3.896000000000006 | 102.095 | 60.137 | 241.109 |
| 3.900000000000006 | 102.428 | 60.319 | 241.708 |
| 3.904000000000006 | 102.762 | 60.502 | 242.308 |
| 3.908000000000006 | 103.097 | 60.685 | 242.909 |
| 3.912000000000006 | 103.433 | 60.868 | 243.511 |
| 3.916000000000006 | 103.769 | 61.052 | 244.114 |
| 3.920000000000006 | 104.106 | 61.236 | 244.717 |
| 3.924000000000006 | 104.444 | 61.421 | 245.322 |
| 3.928000000000006 | 104.782 | 61.606 | 245.928 |
| 3.932000000000006 | 105.122 | 61.791 | 246.535 |
| 3.936000000000006 | 105.462 | 61.977 | 247.142 |
| 3.940000000000006 | 105.802 | 62.163 | 247.751 |
| 3.944000000000006 | 106.144 | 62.349 | 248.361 |
| 3.948000000000006 | 106.486 | 62.536 | 248.972 |
| 3.952000000000006 | 106.829 | 62.724 | 249.583 |
| 3.956000000000006 | 107.172 | 62.911 | 250.196 |
| 3.960000000000006 | 107.517 | 63.099 | 250.809 |
| 3.964000000000006 | 107.862 | 63.288 | 251.424 |
| 3.968000000000006 | 108.207 | 63.476 | 252.04 |
| 3.972000000000006 | 108.554 | 63.665 | 252.656 |
| 3.976000000000006 | 108.901 | 63.855 | 253.274 |
| 3.980000000000006 | 109.249 | 64.045 | 253.892 |
| 3.984000000000006 | 109.598 | 64.235 | 254.512 |
| 3.988000000000006 | 109.947 | 64.426 | 255.132 |
| 3.992000000000006 | 110.297 | 64.617 | 255.754 |
| 3.996000000000006 | 110.648 | 64.808 | 256.376 |
| 4.000000000000005 | 111 | 65 | 257 |
| 4.004000000000005 | 111.352 | 65.192 | 257.624 |
| 4.008000000000004 | 111.705 | 65.385 | 258.25 |
| 4.012000000000004 | 112.059 | 65.578 | 258.876 |
| 4.016000000000004 | 112.414 | 65.771 | 259.504 |
| 4.020000000000003 | 112.769 | 65.965 | 260.132 |
| 4.024000000000003 | 113.125 | 66.159 | 260.762 |
| 4.028000000000002 | 113.482 | 66.353 | 261.392 |
| 4.032000000000002 | 113.84 | 66.548 | 262.024 |
| 4.036000000000001 | 114.198 | 66.744 | 262.656 |
| 4.040000000000001 | 114.557 | 66.939 | 263.29 |
| 4.044 | 114.917 | 67.135 | 263.924 |
| 4.048 | 115.277 | 67.332 | 264.56 |
| 4.052 | 115.638 | 67.529 | 265.196 |
| 4.055999999999999 | 116 | 67.726 | 265.834 |
| 4.059999999999999 | 116.363 | 67.923 | 266.472 |
| 4.063999999999998 | 116.727 | 68.121 | 267.112 |
| 4.067999999999998 | 117.091 | 68.32 | 267.752 |
| 4.071999999999997 | 117.456 | 68.519 | 268.393 |
| 4.075999999999997 | 117.822 | 68.718 | 269.036 |
| 4.079999999999996 | 118.188 | 68.917 | 269.679 |
| 4.083999999999996 | 118.555 | 69.117 | 270.324 |
| 4.087999999999996 | 118.923 | 69.318 | 270.969 |
| 4.091999999999995 | 119.292 | 69.518 | 271.616 |
| 4.095999999999995 | 119.662 | 69.719 | 272.263 |
| 4.099999999999994 | 120.032 | 69.921 | 272.912 |
| 4.103999999999994 | 120.403 | 70.123 | 273.562 |
| 4.107999999999993 | 120.775 | 70.325 | 274.212 |
| 4.111999999999993 | 121.147 | 70.528 | 274.864 |
| 4.115999999999993 | 121.521 | 70.731 | 275.516 |
| 4.119999999999992 | 121.895 | 70.935 | 276.17 |
| 4.123999999999992 | 122.269 | 71.138 | 276.824 |
| 4.127999999999991 | 122.645 | 71.343 | 277.48 |
| 4.131999999999991 | 123.021 | 71.547 | 278.137 |
| 4.13599999999999 | 123.398 | 71.752 | 278.794 |
| 4.13999999999999 | 123.776 | 71.958 | 279.453 |
| 4.143999999999989 | 124.155 | 72.164 | 280.113 |
| 4.147999999999989 | 124.534 | 72.37 | 280.774 |
| 4.151999999999989 | 124.914 | 72.577 | 281.435 |
| 4.155999999999988 | 125.295 | 72.784 | 282.098 |
| 4.159999999999988 | 125.677 | 72.991 | 282.762 |
| 4.163999999999987 | 126.059 | 73.199 | 283.427 |
| 4.167999999999987 | 126.443 | 73.407 | 284.092 |
| 4.171999999999986 | 126.827 | 73.616 | 284.759 |
| 4.175999999999986 | 127.211 | 73.825 | 285.427 |
| 4.179999999999985 | 127.597 | 74.035 | 286.096 |
| 4.183999999999985 | 127.983 | 74.245 | 286.766 |
| 4.187999999999985 | 128.37 | 74.455 | 287.437 |
| 4.191999999999984 | 128.758 | 74.665 | 288.109 |
| 4.195999999999984 | 129.147 | 74.877 | 288.782 |
| 4.199999999999983 | 129.536 | 75.088 | 289.456 |
| 4.203999999999983 | 129.926 | 75.3 | 290.131 |
| 4.207999999999982 | 130.317 | 75.512 | 290.807 |
| 4.211999999999982 | 130.709 | 75.725 | 291.484 |
| 4.215999999999982 | 131.101 | 75.938 | 292.162 |
| 4.219999999999981 | 131.494 | 76.151 | 292.842 |
| 4.223999999999981 | 131.889 | 76.365 | 293.522 |
| 4.22799999999998 | 132.283 | 76.58 | 294.203 |
| 4.23199999999998 | 132.679 | 76.794 | 294.886 |
| 4.23599999999998 | 133.075 | 77.009 | 295.569 |
| 4.239999999999978 | 133.472 | 77.225 | 296.253 |
| 4.243999999999978 | 133.87 | 77.441 | 296.939 |
| 4.247999999999978 | 134.269 | 77.657 | 297.625 |
| 4.251999999999977 | 134.669 | 77.874 | 298.313 |
| 4.255999999999977 | 135.069 | 78.091 | 299.001 |
| 4.259999999999976 | 135.47 | 78.309 | 299.691 |
| 4.263999999999976 | 135.872 | 78.527 | 300.381 |
| 4.267999999999976 | 136.274 | 78.745 | 301.073 |
| 4.271999999999975 | 136.678 | 78.964 | 301.766 |
| 4.275999999999974 | 137.082 | 79.183 | 302.46 |
| 4.279999999999974 | 137.487 | 79.403 | 303.154 |
| 4.283999999999974 | 137.893 | 79.623 | 303.85 |
| 4.287999999999974 | 138.299 | 79.843 | 304.547 |
| 4.291999999999973 | 138.707 | 80.064 | 305.245 |
| 4.295999999999973 | 139.115 | 80.285 | 305.944 |
| 4.299999999999972 | 139.524 | 80.507 | 306.644 |
| 4.303999999999972 | 139.934 | 80.729 | 307.345 |
| 4.307999999999971 | 140.344 | 80.952 | 308.047 |
| 4.311999999999971 | 140.756 | 81.174 | 308.75 |
| 4.31599999999997 | 141.168 | 81.398 | 309.455 |
| 4.31999999999997 | 141.581 | 81.622 | 310.16 |
| 4.32399999999997 | 141.994 | 81.846 | 310.866 |
| 4.327999999999969 | 142.409 | 82.07 | 311.574 |
| 4.331999999999968 | 142.824 | 82.295 | 312.282 |
| 4.335999999999968 | 143.24 | 82.521 | 312.992 |
| 4.339999999999967 | 143.657 | 82.747 | 313.702 |
| 4.343999999999967 | 144.075 | 82.973 | 314.414 |
| 4.347999999999967 | 144.494 | 83.199 | 315.127 |
| 4.351999999999966 | 144.913 | 83.426 | 315.84 |
| 4.355999999999966 | 145.333 | 83.654 | 316.555 |
| 4.359999999999965 | 145.754 | 83.882 | 317.271 |
| 4.363999999999965 | 146.176 | 84.11 | 317.988 |
| 4.367999999999965 | 146.598 | 84.339 | 318.706 |
| 4.371999999999964 | 147.022 | 84.568 | 319.425 |
| 4.375999999999964 | 147.446 | 84.798 | 320.145 |
| 4.379999999999963 | 147.871 | 85.028 | 320.866 |
| 4.383999999999963 | 148.297 | 85.258 | 321.588 |
| 4.387999999999963 | 148.723 | 85.489 | 322.312 |
| 4.391999999999962 | 149.151 | 85.72 | 323.036 |
| 4.395999999999962 | 149.579 | 85.952 | 323.761 |
| 4.399999999999961 | 150.008 | 86.184 | 324.488 |
| 4.40399999999996 | 150.438 | 86.417 | 325.216 |
| 4.40799999999996 | 150.869 | 86.649 | 325.944 |
| 4.41199999999996 | 151.3 | 86.883 | 326.674 |
| 4.415999999999959 | 151.732 | 87.117 | 327.405 |
| 4.41999999999996 | 152.165 | 87.351 | 328.137 |
| 4.423999999999959 | 152.599 | 87.586 | 328.87 |
| 4.427999999999958 | 153.034 | 87.821 | 329.604 |
| 4.431999999999957 | 153.47 | 88.056 | 330.339 |
| 4.435999999999957 | 153.906 | 88.292 | 331.075 |
| 4.439999999999956 | 154.343 | 88.528 | 331.812 |
| 4.443999999999956 | 154.781 | 88.765 | 332.55 |
| 4.447999999999956 | 155.22 | 89.002 | 333.29 |
| 4.451999999999955 | 155.66 | 89.24 | 334.03 |
| 4.455999999999955 | 156.1 | 89.478 | 334.772 |
| 4.459999999999954 | 156.541 | 89.717 | 335.514 |
| 4.463999999999954 | 156.984 | 89.955 | 336.258 |
| 4.467999999999954 | 157.427 | 90.195 | 337.003 |
| 4.471999999999953 | 157.87 | 90.435 | 337.749 |
| 4.475999999999953 | 158.315 | 90.675 | 338.496 |
| 4.479999999999952 | 158.76 | 90.915 | 339.244 |
| 4.483999999999952 | 159.207 | 91.156 | 339.993 |
| 4.487999999999952 | 159.654 | 91.398 | 340.743 |
| 4.491999999999951 | 160.102 | 91.64 | 341.494 |
| 4.495999999999951 | 160.55 | 91.882 | 342.247 |
| 4.49999999999995 | 161 | 92.125 | 343 |
| 4.50399999999995 | 161.45 | 92.368 | 343.755 |
| 4.507999999999949 | 161.902 | 92.612 | 344.51 |
| 4.511999999999949 | 162.354 | 92.856 | 345.267 |
| 4.515999999999948 | 162.807 | 93.1 | 346.025 |
| 4.519999999999948 | 163.26 | 93.345 | 346.784 |
| 4.523999999999948 | 163.715 | 93.591 | 347.544 |
| 4.527999999999947 | 164.17 | 93.837 | 348.305 |
| 4.531999999999946 | 164.627 | 94.083 | 349.067 |
| 4.535999999999946 | 165.084 | 94.33 | 349.83 |
| 4.539999999999945 | 165.542 | 94.577 | 350.595 |
| 4.543999999999945 | 166.001 | 94.824 | 351.36 |
| 4.547999999999945 | 166.46 | 95.072 | 352.127 |
| 4.551999999999944 | 166.921 | 95.321 | 352.894 |
| 4.555999999999944 | 167.382 | 95.57 | 353.663 |
| 4.559999999999944 | 167.844 | 95.819 | 354.433 |
| 4.563999999999943 | 168.307 | 96.069 | 355.204 |
| 4.567999999999943 | 168.771 | 96.319 | 355.976 |
| 4.571999999999942 | 169.236 | 96.569 | 356.749 |
| 4.575999999999942 | 169.701 | 96.82 | 357.523 |
| 4.579999999999941 | 170.167 | 97.072 | 358.299 |
| 4.583999999999941 | 170.635 | 97.324 | 359.075 |
| 4.587999999999941 | 171.103 | 97.576 | 359.853 |
| 4.59199999999994 | 171.572 | 97.829 | 360.631 |
| 4.59599999999994 | 172.041 | 98.082 | 361.411 |
| 4.59999999999994 | 172.512 | 98.336 | 362.192 |
| 4.603999999999939 | 172.983 | 98.59 | 362.974 |
| 4.607999999999938 | 173.456 | 98.845 | 363.757 |
| 4.611999999999938 | 173.929 | 99.1 | 364.541 |
| 4.615999999999937 | 174.403 | 99.355 | 365.327 |
| 4.619999999999937 | 174.878 | 99.611 | 366.113 |
| 4.623999999999937 | 175.354 | 99.867 | 366.901 |
| 4.627999999999936 | 175.83 | 100.124 | 367.689 |
| 4.631999999999935 | 176.308 | 100.382 | 368.479 |
| 4.635999999999935 | 176.786 | 100.639 | 369.27 |
| 4.639999999999934 | 177.265 | 100.897 | 370.062 |
| 4.643999999999934 | 177.745 | 101.156 | 370.855 |
| 4.647999999999934 | 178.226 | 101.415 | 371.649 |
| 4.651999999999933 | 178.708 | 101.674 | 372.445 |
| 4.655999999999933 | 179.19 | 101.934 | 373.241 |
| 4.659999999999933 | 179.674 | 102.195 | 374.039 |
| 4.663999999999932 | 180.158 | 102.456 | 374.837 |
| 4.667999999999932 | 180.643 | 102.717 | 375.637 |
| 4.671999999999931 | 181.129 | 102.978 | 376.438 |
| 4.675999999999931 | 181.616 | 103.241 | 377.24 |
| 4.67999999999993 | 182.104 | 103.503 | 378.043 |
| 4.68399999999993 | 182.593 | 103.766 | 378.848 |
| 4.687999999999929 | 183.082 | 104.03 | 379.653 |
| 4.69199999999993 | 183.573 | 104.294 | 380.46 |
| 4.695999999999929 | 184.064 | 104.558 | 381.267 |
| 4.699999999999928 | 184.556 | 104.823 | 382.076 |
| 4.703999999999927 | 185.049 | 105.088 | 382.886 |
| 4.707999999999927 | 185.543 | 105.354 | 383.697 |
| 4.711999999999926 | 186.038 | 105.62 | 384.509 |
| 4.715999999999926 | 186.533 | 105.887 | 385.322 |
| 4.719999999999925 | 187.03 | 106.154 | 386.137 |
| 4.723999999999925 | 187.527 | 106.422 | 386.952 |
| 4.727999999999925 | 188.025 | 106.69 | 387.769 |
| 4.731999999999924 | 188.524 | 106.958 | 388.587 |
| 4.735999999999924 | 189.024 | 107.227 | 389.406 |
| 4.739999999999923 | 189.525 | 107.496 | 390.226 |
| 4.743999999999923 | 190.027 | 107.766 | 391.047 |
| 4.747999999999923 | 190.53 | 108.037 | 391.87 |
| 4.751999999999922 | 191.033 | 108.307 | 392.693 |
| 4.755999999999922 | 191.537 | 108.579 | 393.518 |
| 4.759999999999921 | 192.043 | 108.85 | 394.344 |
| 4.763999999999921 | 192.549 | 109.122 | 395.17 |
| 4.767999999999921 | 193.056 | 109.395 | 395.999 |
| 4.77199999999992 | 193.564 | 109.668 | 396.828 |
| 4.77599999999992 | 194.073 | 109.941 | 397.658 |
| 4.77999999999992 | 194.582 | 110.215 | 398.49 |
| 4.783999999999919 | 195.093 | 110.49 | 399.322 |
| 4.787999999999918 | 195.604 | 110.765 | 400.156 |
| 4.791999999999918 | 196.117 | 111.04 | 400.991 |
| 4.795999999999918 | 196.63 | 111.316 | 401.827 |
| 4.799999999999917 | 197.144 | 111.592 | 402.664 |
| 4.803999999999917 | 197.659 | 111.869 | 403.502 |
| 4.807999999999916 | 198.175 | 112.146 | 404.342 |
| 4.811999999999916 | 198.692 | 112.424 | 405.182 |
| 4.815999999999915 | 199.209 | 112.702 | 406.024 |
| 4.819999999999915 | 199.728 | 112.98 | 406.867 |
| 4.823999999999915 | 200.247 | 113.259 | 407.711 |
| 4.827999999999914 | 200.768 | 113.539 | 408.556 |
| 4.831999999999914 | 201.289 | 113.819 | 409.403 |
| 4.835999999999913 | 201.811 | 114.099 | 410.25 |
| 4.839999999999913 | 202.334 | 114.38 | 411.099 |
| 4.843999999999912 | 202.858 | 114.661 | 411.949 |
| 4.847999999999912 | 203.383 | 114.943 | 412.8 |
| 4.851999999999911 | 203.909 | 115.225 | 413.652 |
| 4.855999999999911 | 204.435 | 115.508 | 414.505 |
| 4.859999999999911 | 204.963 | 115.791 | 415.36 |
| 4.86399999999991 | 205.491 | 116.075 | 416.215 |
| 4.86799999999991 | 206.021 | 116.359 | 417.072 |
| 4.87199999999991 | 206.551 | 116.644 | 417.93 |
| 4.875999999999909 | 207.082 | 116.929 | 418.789 |
| 4.879999999999908 | 207.614 | 117.214 | 419.649 |
| 4.883999999999908 | 208.147 | 117.5 | 420.511 |
| 4.887999999999907 | 208.681 | 117.787 | 421.373 |
| 4.891999999999907 | 209.216 | 118.074 | 422.237 |
| 4.895999999999907 | 209.751 | 118.361 | 423.102 |
| 4.899999999999906 | 210.288 | 118.649 | 423.968 |
| 4.903999999999905 | 210.825 | 118.937 | 424.835 |
| 4.907999999999905 | 211.364 | 119.226 | 425.704 |
| 4.911999999999904 | 211.903 | 119.515 | 426.573 |
| 4.915999999999904 | 212.443 | 119.805 | 427.444 |
| 4.919999999999904 | 212.985 | 120.095 | 428.316 |
| 4.923999999999904 | 213.527 | 120.386 | 429.189 |
| 4.927999999999903 | 214.07 | 120.677 | 430.063 |
| 4.931999999999902 | 214.613 | 120.969 | 430.938 |
| 4.935999999999902 | 215.158 | 121.261 | 431.815 |
| 4.939999999999901 | 215.704 | 121.554 | 432.693 |
| 4.943999999999901 | 216.251 | 121.847 | 433.572 |
| 4.947999999999901 | 216.798 | 122.14 | 434.452 |
| 4.9519999999999 | 217.347 | 122.434 | 435.333 |
| 4.9559999999999 | 217.896 | 122.729 | 436.215 |
| 4.9599999999999 | 218.446 | 123.024 | 437.099 |
| 4.9639999999999 | 218.997 | 123.319 | 437.984 |
| 4.967999999999899 | 219.55 | 123.615 | 438.87 |
| 4.971999999999898 | 220.103 | 123.912 | 439.757 |
| 4.975999999999897 | 220.657 | 124.209 | 440.645 |
| 4.979999999999897 | 221.212 | 124.506 | 441.535 |
| 4.983999999999896 | 221.767 | 124.804 | 442.425 |
| 4.987999999999896 | 222.324 | 125.102 | 443.317 |
| 4.991999999999896 | 222.882 | 125.401 | 444.21 |
| 4.995999999999895 | 223.44 | 125.7 | 445.105 |
| 4.999999999999895 | 224 | 126 | 446 |